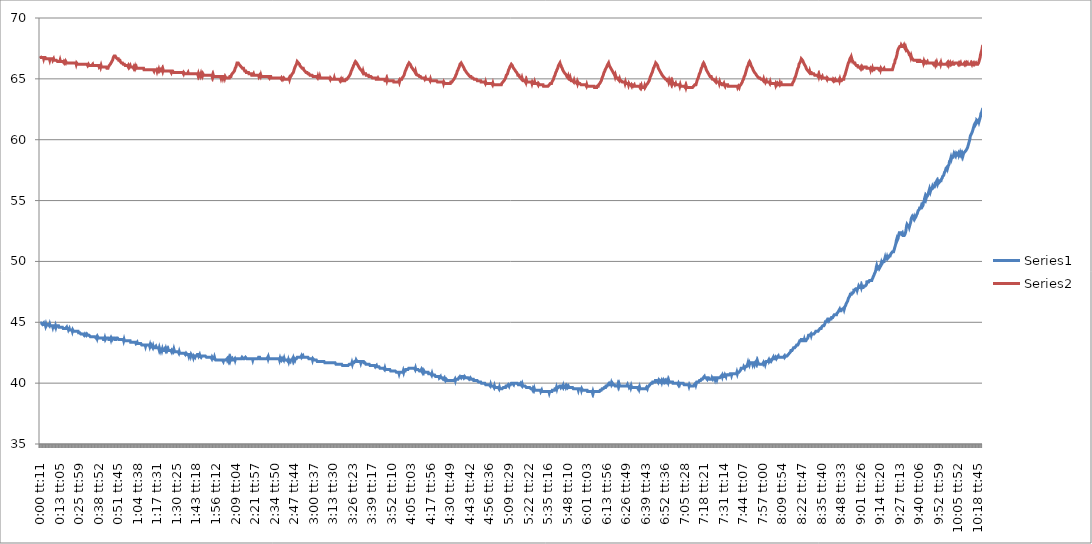
| Category | Series 0 | Series 1 |
|---|---|---|
| 0.0001273148148148148 | 44.938 | 66.875 |
| 0.0003125 | 44.938 | 66.875 |
| 0.00048611111111111104 | 44.938 | 66.762 |
| 0.0006597222222222221 | 44.938 | 66.762 |
| 0.0008333333333333334 | 44.938 | 66.762 |
| 0.0010069444444444444 | 44.938 | 66.762 |
| 0.0011921296296296296 | 44.825 | 66.762 |
| 0.001365740740740741 | 44.825 | 66.762 |
| 0.0015393518518518519 | 44.825 | 66.762 |
| 0.001712962962962963 | 44.938 | 66.65 |
| 0.0018865740740740742 | 44.825 | 66.762 |
| 0.0020601851851851853 | 44.825 | 66.762 |
| 0.0022337962962962967 | 44.825 | 66.762 |
| 0.0024189814814814816 | 44.825 | 66.762 |
| 0.0025925925925925925 | 44.712 | 66.762 |
| 0.0027662037037037034 | 44.825 | 66.65 |
| 0.002939814814814815 | 44.712 | 66.65 |
| 0.0031134259259259257 | 44.712 | 66.65 |
| 0.003298611111111111 | 44.825 | 66.65 |
| 0.003472222222222222 | 44.825 | 66.65 |
| 0.003645833333333333 | 44.825 | 66.65 |
| 0.0038194444444444443 | 44.825 | 66.65 |
| 0.003993055555555556 | 44.825 | 66.65 |
| 0.004166666666666667 | 44.825 | 66.65 |
| 0.0043518518518518515 | 44.712 | 66.65 |
| 0.004525462962962963 | 44.825 | 66.538 |
| 0.004699074074074074 | 44.712 | 66.65 |
| 0.004872685185185186 | 44.712 | 66.65 |
| 0.005046296296296296 | 44.712 | 66.65 |
| 0.005219907407407407 | 44.712 | 66.65 |
| 0.005393518518518519 | 44.712 | 66.65 |
| 0.005578703703703704 | 44.712 | 66.65 |
| 0.005752314814814814 | 44.712 | 66.65 |
| 0.005925925925925926 | 44.6 | 66.538 |
| 0.006099537037037036 | 44.712 | 66.538 |
| 0.006273148148148148 | 44.712 | 66.65 |
| 0.00644675925925926 | 44.712 | 66.538 |
| 0.00662037037037037 | 44.712 | 66.538 |
| 0.006805555555555557 | 44.712 | 66.538 |
| 0.006979166666666667 | 44.6 | 66.538 |
| 0.007152777777777779 | 44.712 | 66.538 |
| 0.007326388888888889 | 44.6 | 66.538 |
| 0.007500000000000001 | 44.712 | 66.538 |
| 0.007673611111111111 | 44.712 | 66.538 |
| 0.007858796296296296 | 44.712 | 66.538 |
| 0.008032407407407407 | 44.712 | 66.425 |
| 0.008206018518518519 | 44.712 | 66.425 |
| 0.00837962962962963 | 44.712 | 66.425 |
| 0.008553240740740741 | 44.712 | 66.425 |
| 0.008726851851851852 | 44.6 | 66.425 |
| 0.008900462962962962 | 44.6 | 66.425 |
| 0.009085648148148148 | 44.6 | 66.425 |
| 0.00925925925925926 | 44.6 | 66.538 |
| 0.009432870370370371 | 44.6 | 66.425 |
| 0.009606481481481481 | 44.6 | 66.425 |
| 0.009791666666666666 | 44.6 | 66.425 |
| 0.009965277777777778 | 44.6 | 66.425 |
| 0.010138888888888888 | 44.6 | 66.425 |
| 0.0103125 | 44.6 | 66.425 |
| 0.010486111111111111 | 44.6 | 66.425 |
| 0.010659722222222221 | 44.488 | 66.425 |
| 0.010844907407407407 | 44.488 | 66.425 |
| 0.011018518518518518 | 44.488 | 66.312 |
| 0.01119212962962963 | 44.488 | 66.425 |
| 0.01136574074074074 | 44.488 | 66.425 |
| 0.011539351851851851 | 44.488 | 66.425 |
| 0.011712962962962965 | 44.488 | 66.312 |
| 0.011898148148148149 | 44.488 | 66.425 |
| 0.01207175925925926 | 44.488 | 66.425 |
| 0.01224537037037037 | 44.6 | 66.312 |
| 0.012418981481481482 | 44.488 | 66.312 |
| 0.012592592592592593 | 44.488 | 66.312 |
| 0.012766203703703703 | 44.488 | 66.312 |
| 0.012951388888888887 | 44.488 | 66.312 |
| 0.013125 | 44.375 | 66.312 |
| 0.01329861111111111 | 44.375 | 66.312 |
| 0.01347222222222222 | 44.488 | 66.312 |
| 0.013645833333333331 | 44.375 | 66.312 |
| 0.013819444444444445 | 44.375 | 66.312 |
| 0.01400462962962963 | 44.375 | 66.312 |
| 0.014178240740740741 | 44.375 | 66.312 |
| 0.014351851851851852 | 44.375 | 66.312 |
| 0.014525462962962964 | 44.375 | 66.312 |
| 0.014699074074074074 | 44.375 | 66.312 |
| 0.014872685185185185 | 44.262 | 66.312 |
| 0.015057870370370369 | 44.375 | 66.312 |
| 0.015231481481481483 | 44.375 | 66.312 |
| 0.015405092592592593 | 44.262 | 66.312 |
| 0.015578703703703704 | 44.262 | 66.312 |
| 0.015752314814814813 | 44.262 | 66.312 |
| 0.015925925925925927 | 44.262 | 66.312 |
| 0.01611111111111111 | 44.262 | 66.312 |
| 0.01628472222222222 | 44.262 | 66.312 |
| 0.016458333333333332 | 44.262 | 66.312 |
| 0.016631944444444446 | 44.262 | 66.2 |
| 0.016805555555555556 | 44.262 | 66.312 |
| 0.01699074074074074 | 44.262 | 66.312 |
| 0.01716435185185185 | 44.262 | 66.312 |
| 0.01733796296296296 | 44.262 | 66.2 |
| 0.017511574074074072 | 44.262 | 66.2 |
| 0.017685185185185182 | 44.15 | 66.2 |
| 0.017858796296296296 | 44.15 | 66.2 |
| 0.018043981481481484 | 44.15 | 66.2 |
| 0.018217592592592594 | 44.15 | 66.2 |
| 0.018391203703703705 | 44.15 | 66.2 |
| 0.018564814814814815 | 44.15 | 66.2 |
| 0.018738425925925926 | 44.038 | 66.2 |
| 0.018912037037037036 | 44.038 | 66.2 |
| 0.01909722222222222 | 44.038 | 66.2 |
| 0.019270833333333334 | 44.038 | 66.2 |
| 0.019444444444444445 | 44.038 | 66.2 |
| 0.019618055555555555 | 44.038 | 66.2 |
| 0.019791666666666666 | 44.038 | 66.2 |
| 0.01996527777777778 | 44.038 | 66.2 |
| 0.020150462962962964 | 44.038 | 66.2 |
| 0.020324074074074074 | 43.925 | 66.2 |
| 0.020497685185185185 | 43.925 | 66.2 |
| 0.020671296296296295 | 44.038 | 66.2 |
| 0.020844907407407406 | 44.038 | 66.2 |
| 0.02101851851851852 | 44.038 | 66.2 |
| 0.02119212962962963 | 43.925 | 66.2 |
| 0.021377314814814818 | 43.925 | 66.2 |
| 0.021550925925925928 | 44.038 | 66.2 |
| 0.02172453703703704 | 44.038 | 66.2 |
| 0.02189814814814815 | 44.038 | 66.088 |
| 0.02207175925925926 | 43.925 | 66.088 |
| 0.02224537037037037 | 43.925 | 66.2 |
| 0.022430555555555554 | 43.925 | 66.2 |
| 0.022604166666666665 | 43.925 | 66.088 |
| 0.022777777777777775 | 43.925 | 66.088 |
| 0.022951388888888886 | 43.925 | 66.088 |
| 0.023124999999999996 | 43.812 | 66.088 |
| 0.023298611111111107 | 43.812 | 66.088 |
| 0.023483796296296298 | 43.812 | 66.088 |
| 0.023657407407407408 | 43.812 | 66.088 |
| 0.02383101851851852 | 43.812 | 66.088 |
| 0.02400462962962963 | 43.812 | 66.088 |
| 0.02417824074074074 | 43.812 | 66.2 |
| 0.024351851851851857 | 43.812 | 66.088 |
| 0.024537037037037038 | 43.812 | 66.088 |
| 0.024710648148148148 | 43.812 | 66.088 |
| 0.02488425925925926 | 43.812 | 66.088 |
| 0.025057870370370373 | 43.812 | 66.088 |
| 0.025231481481481483 | 43.812 | 66.088 |
| 0.025405092592592594 | 43.812 | 66.088 |
| 0.025578703703703704 | 43.812 | 66.088 |
| 0.02576388888888889 | 43.7 | 66.088 |
| 0.025937500000000002 | 43.7 | 66.088 |
| 0.026111111111111113 | 43.812 | 66.088 |
| 0.026284722222222223 | 43.7 | 66.088 |
| 0.026458333333333334 | 43.812 | 66.088 |
| 0.026631944444444444 | 43.812 | 66.088 |
| 0.026805555555555555 | 43.7 | 66.088 |
| 0.026990740740740742 | 43.7 | 66.088 |
| 0.027164351851851853 | 43.7 | 65.975 |
| 0.027337962962962963 | 43.7 | 65.975 |
| 0.027511574074074074 | 43.7 | 65.975 |
| 0.027685185185185188 | 43.7 | 66.088 |
| 0.027858796296296298 | 43.7 | 65.975 |
| 0.02803240740740741 | 43.7 | 66.088 |
| 0.02821759259259259 | 43.7 | 65.975 |
| 0.028391203703703707 | 43.7 | 65.975 |
| 0.028564814814814817 | 43.7 | 65.975 |
| 0.028738425925925928 | 43.7 | 65.975 |
| 0.028912037037037038 | 43.7 | 65.975 |
| 0.02908564814814815 | 43.588 | 65.975 |
| 0.029270833333333333 | 43.588 | 65.975 |
| 0.029444444444444443 | 43.588 | 65.975 |
| 0.029618055555555554 | 43.588 | 65.975 |
| 0.029791666666666664 | 43.7 | 65.975 |
| 0.029965277777777775 | 43.588 | 65.975 |
| 0.030150462962962962 | 43.588 | 65.975 |
| 0.030324074074074073 | 43.7 | 65.975 |
| 0.030497685185185183 | 43.7 | 65.975 |
| 0.030671296296296294 | 43.7 | 65.862 |
| 0.030844907407407404 | 43.7 | 65.862 |
| 0.031018518518518515 | 43.7 | 65.862 |
| 0.031203703703703702 | 43.7 | 65.862 |
| 0.03137731481481481 | 43.7 | 65.975 |
| 0.03155092592592592 | 43.588 | 65.975 |
| 0.03172453703703703 | 43.588 | 66.088 |
| 0.03189814814814815 | 43.588 | 66.088 |
| 0.03207175925925926 | 43.588 | 66.088 |
| 0.03225694444444444 | 43.588 | 66.2 |
| 0.03243055555555556 | 43.7 | 66.2 |
| 0.03260416666666667 | 43.588 | 66.312 |
| 0.03277777777777778 | 43.7 | 66.312 |
| 0.03295138888888889 | 43.7 | 66.425 |
| 0.033136574074074075 | 43.588 | 66.425 |
| 0.033310185185185186 | 43.588 | 66.538 |
| 0.033483796296296296 | 43.7 | 66.65 |
| 0.03365740740740741 | 43.7 | 66.762 |
| 0.03383101851851852 | 43.7 | 66.762 |
| 0.03400462962962963 | 43.7 | 66.875 |
| 0.03418981481481482 | 43.7 | 66.875 |
| 0.03436342592592593 | 43.588 | 66.875 |
| 0.03453703703703704 | 43.588 | 66.875 |
| 0.03471064814814815 | 43.588 | 66.875 |
| 0.03488425925925926 | 43.588 | 66.762 |
| 0.03505787037037037 | 43.7 | 66.762 |
| 0.035243055555555555 | 43.7 | 66.762 |
| 0.035416666666666666 | 43.7 | 66.65 |
| 0.035590277777777776 | 43.7 | 66.65 |
| 0.03576388888888889 | 43.7 | 66.65 |
| 0.035937500000000004 | 43.7 | 66.65 |
| 0.036111111111111115 | 43.588 | 66.538 |
| 0.03629629629629629 | 43.588 | 66.538 |
| 0.0364699074074074 | 43.588 | 66.538 |
| 0.03664351851851852 | 43.588 | 66.538 |
| 0.03681712962962963 | 43.588 | 66.425 |
| 0.03699074074074074 | 43.588 | 66.425 |
| 0.03716435185185185 | 43.588 | 66.425 |
| 0.03733796296296296 | 43.588 | 66.312 |
| 0.037523148148148146 | 43.588 | 66.312 |
| 0.037696759259259256 | 43.588 | 66.312 |
| 0.03787037037037037 | 43.588 | 66.312 |
| 0.03804398148148148 | 43.588 | 66.312 |
| 0.03821759259259259 | 43.588 | 66.2 |
| 0.0383912037037037 | 43.475 | 66.2 |
| 0.03857638888888889 | 43.588 | 66.2 |
| 0.03875 | 43.475 | 66.2 |
| 0.03892361111111111 | 43.475 | 66.2 |
| 0.03909722222222222 | 43.475 | 66.088 |
| 0.03927083333333333 | 43.475 | 66.088 |
| 0.03944444444444444 | 43.475 | 66.088 |
| 0.03961805555555555 | 43.475 | 66.088 |
| 0.03980324074074074 | 43.475 | 66.088 |
| 0.039976851851851854 | 43.475 | 66.088 |
| 0.040150462962962964 | 43.475 | 66.088 |
| 0.040324074074074075 | 43.475 | 66.088 |
| 0.040497685185185185 | 43.475 | 65.975 |
| 0.040671296296296296 | 43.475 | 66.088 |
| 0.040844907407407406 | 43.475 | 66.088 |
| 0.0410300925925926 | 43.475 | 65.975 |
| 0.04120370370370371 | 43.475 | 65.975 |
| 0.04137731481481482 | 43.475 | 66.088 |
| 0.04155092592592593 | 43.362 | 65.975 |
| 0.04172453703703704 | 43.362 | 65.975 |
| 0.04189814814814815 | 43.362 | 65.975 |
| 0.042083333333333334 | 43.362 | 65.975 |
| 0.042256944444444444 | 43.362 | 65.975 |
| 0.042430555555555555 | 43.362 | 65.975 |
| 0.042604166666666665 | 43.362 | 65.975 |
| 0.042777777777777776 | 43.362 | 65.975 |
| 0.042951388888888886 | 43.362 | 65.862 |
| 0.04313657407407407 | 43.362 | 65.975 |
| 0.04331018518518518 | 43.362 | 65.975 |
| 0.04348379629629629 | 43.362 | 65.862 |
| 0.0436574074074074 | 43.362 | 65.975 |
| 0.04383101851851851 | 43.362 | 65.862 |
| 0.04400462962962962 | 43.25 | 65.862 |
| 0.04417824074074075 | 43.25 | 65.975 |
| 0.044363425925925924 | 43.25 | 65.862 |
| 0.04453703703703704 | 43.362 | 65.862 |
| 0.04471064814814815 | 43.25 | 65.862 |
| 0.04488425925925926 | 43.25 | 65.862 |
| 0.04505787037037037 | 43.25 | 65.862 |
| 0.045231481481481484 | 43.25 | 65.862 |
| 0.04541666666666667 | 43.25 | 65.862 |
| 0.04559027777777778 | 43.25 | 65.862 |
| 0.04576388888888889 | 43.25 | 65.862 |
| 0.0459375 | 43.25 | 65.862 |
| 0.04611111111111111 | 43.25 | 65.862 |
| 0.04628472222222222 | 43.25 | 65.862 |
| 0.04646990740740741 | 43.25 | 65.862 |
| 0.04664351851851852 | 43.138 | 65.862 |
| 0.04681712962962963 | 43.138 | 65.862 |
| 0.04699074074074074 | 43.138 | 65.862 |
| 0.04716435185185185 | 43.138 | 65.862 |
| 0.047337962962962964 | 43.138 | 65.862 |
| 0.047511574074074074 | 43.138 | 65.862 |
| 0.04769675925925926 | 43.138 | 65.75 |
| 0.04787037037037037 | 43.138 | 65.75 |
| 0.04804398148148148 | 43.138 | 65.75 |
| 0.04821759259259259 | 43.138 | 65.75 |
| 0.0483912037037037 | 43.025 | 65.75 |
| 0.048576388888888884 | 43.138 | 65.75 |
| 0.048749999999999995 | 43.138 | 65.75 |
| 0.048923611111111105 | 43.138 | 65.75 |
| 0.049097222222222216 | 43.138 | 65.75 |
| 0.04927083333333334 | 43.138 | 65.75 |
| 0.04944444444444444 | 43.138 | 65.75 |
| 0.04961805555555556 | 43.138 | 65.75 |
| 0.04980324074074074 | 43.138 | 65.75 |
| 0.049976851851851856 | 43.138 | 65.75 |
| 0.050150462962962966 | 43.138 | 65.75 |
| 0.05032407407407408 | 43.025 | 65.75 |
| 0.05049768518518519 | 43.138 | 65.75 |
| 0.0506712962962963 | 43.025 | 65.75 |
| 0.05085648148148148 | 43.025 | 65.75 |
| 0.05103009259259259 | 43.138 | 65.75 |
| 0.0512037037037037 | 43.138 | 65.75 |
| 0.05137731481481481 | 43.025 | 65.75 |
| 0.051550925925925924 | 43.025 | 65.75 |
| 0.051724537037037034 | 42.912 | 65.75 |
| 0.051909722222222225 | 43.025 | 65.75 |
| 0.052083333333333336 | 42.912 | 65.75 |
| 0.052256944444444446 | 42.912 | 65.638 |
| 0.05243055555555556 | 42.912 | 65.75 |
| 0.05260416666666667 | 42.912 | 65.75 |
| 0.05277777777777778 | 42.912 | 65.75 |
| 0.05295138888888889 | 42.912 | 65.75 |
| 0.05313657407407407 | 43.025 | 65.75 |
| 0.05331018518518518 | 42.912 | 65.75 |
| 0.05348379629629629 | 42.912 | 65.75 |
| 0.053657407407407404 | 42.912 | 65.638 |
| 0.053831018518518514 | 42.912 | 65.75 |
| 0.05400462962962963 | 42.912 | 65.75 |
| 0.05418981481481481 | 42.912 | 65.75 |
| 0.05436342592592593 | 42.912 | 65.638 |
| 0.054537037037037044 | 42.8 | 65.75 |
| 0.054710648148148154 | 42.912 | 65.638 |
| 0.054884259259259265 | 42.8 | 65.638 |
| 0.055057870370370375 | 42.688 | 65.638 |
| 0.05524305555555556 | 42.8 | 65.75 |
| 0.05541666666666667 | 42.8 | 65.638 |
| 0.05559027777777778 | 42.8 | 65.638 |
| 0.05576388888888889 | 42.8 | 65.638 |
| 0.0559375 | 42.688 | 65.638 |
| 0.05611111111111111 | 42.8 | 65.75 |
| 0.05628472222222222 | 42.688 | 65.638 |
| 0.056469907407407406 | 42.688 | 65.75 |
| 0.05664351851851852 | 42.688 | 65.638 |
| 0.05681712962962963 | 42.688 | 65.638 |
| 0.05699074074074074 | 42.688 | 65.638 |
| 0.05716435185185185 | 42.8 | 65.638 |
| 0.05733796296296296 | 42.8 | 65.638 |
| 0.05752314814814815 | 42.688 | 65.638 |
| 0.05769675925925926 | 42.8 | 65.638 |
| 0.05787037037037037 | 42.688 | 65.638 |
| 0.05804398148148148 | 42.688 | 65.638 |
| 0.05821759259259259 | 42.8 | 65.638 |
| 0.0583912037037037 | 42.688 | 65.638 |
| 0.058576388888888886 | 42.688 | 65.638 |
| 0.058750000000000004 | 42.8 | 65.638 |
| 0.05892361111111111 | 42.688 | 65.638 |
| 0.059097222222222225 | 42.688 | 65.638 |
| 0.059270833333333335 | 42.688 | 65.638 |
| 0.059444444444444446 | 42.688 | 65.638 |
| 0.059618055555555556 | 42.688 | 65.638 |
| 0.05980324074074075 | 42.688 | 65.638 |
| 0.05997685185185186 | 42.688 | 65.638 |
| 0.06015046296296297 | 42.688 | 65.525 |
| 0.06032407407407408 | 42.575 | 65.638 |
| 0.06049768518518519 | 42.688 | 65.638 |
| 0.06068287037037037 | 42.688 | 65.638 |
| 0.060856481481481484 | 42.688 | 65.638 |
| 0.061030092592592594 | 42.575 | 65.638 |
| 0.061203703703703705 | 42.688 | 65.525 |
| 0.061377314814814815 | 42.8 | 65.525 |
| 0.061550925925925926 | 42.688 | 65.525 |
| 0.06173611111111111 | 42.575 | 65.525 |
| 0.06190972222222222 | 42.575 | 65.525 |
| 0.06208333333333333 | 42.575 | 65.525 |
| 0.06225694444444444 | 42.575 | 65.525 |
| 0.06243055555555555 | 42.575 | 65.525 |
| 0.06260416666666667 | 42.575 | 65.525 |
| 0.06278935185185185 | 42.575 | 65.525 |
| 0.06296296296296296 | 42.575 | 65.525 |
| 0.06313657407407408 | 42.575 | 65.525 |
| 0.06331018518518518 | 42.575 | 65.525 |
| 0.0634837962962963 | 42.575 | 65.525 |
| 0.0636574074074074 | 42.462 | 65.525 |
| 0.0638425925925926 | 42.575 | 65.525 |
| 0.0640162037037037 | 42.462 | 65.525 |
| 0.06418981481481481 | 42.462 | 65.525 |
| 0.06436342592592592 | 42.462 | 65.525 |
| 0.06453703703703705 | 42.462 | 65.525 |
| 0.06471064814814814 | 42.462 | 65.525 |
| 0.06489583333333333 | 42.462 | 65.525 |
| 0.06506944444444444 | 42.462 | 65.525 |
| 0.06524305555555555 | 42.462 | 65.525 |
| 0.06541666666666666 | 42.462 | 65.525 |
| 0.06559027777777778 | 42.462 | 65.525 |
| 0.06577546296296297 | 42.462 | 65.412 |
| 0.06594907407407408 | 42.462 | 65.525 |
| 0.06612268518518519 | 42.462 | 65.525 |
| 0.0662962962962963 | 42.462 | 65.525 |
| 0.06646990740740741 | 42.462 | 65.412 |
| 0.0666550925925926 | 42.35 | 65.412 |
| 0.06682870370370371 | 42.35 | 65.412 |
| 0.06700231481481482 | 42.462 | 65.412 |
| 0.06717592592592593 | 42.462 | 65.412 |
| 0.06734953703703704 | 42.462 | 65.412 |
| 0.06752314814814815 | 42.35 | 65.412 |
| 0.06770833333333333 | 42.35 | 65.412 |
| 0.06788194444444444 | 42.35 | 65.525 |
| 0.06805555555555555 | 42.35 | 65.412 |
| 0.06822916666666666 | 42.238 | 65.412 |
| 0.06840277777777777 | 42.35 | 65.412 |
| 0.0685763888888889 | 42.35 | 65.412 |
| 0.06874999999999999 | 42.35 | 65.412 |
| 0.06892361111111112 | 42.35 | 65.412 |
| 0.0691087962962963 | 42.238 | 65.412 |
| 0.06928240740740742 | 42.35 | 65.412 |
| 0.06945601851851851 | 42.35 | 65.412 |
| 0.06962962962962964 | 42.238 | 65.412 |
| 0.06980324074074074 | 42.238 | 65.412 |
| 0.06997685185185186 | 42.238 | 65.412 |
| 0.07016203703703704 | 42.238 | 65.412 |
| 0.07033564814814815 | 42.125 | 65.412 |
| 0.07050925925925926 | 42.238 | 65.412 |
| 0.07068287037037037 | 42.238 | 65.412 |
| 0.07085648148148148 | 42.238 | 65.412 |
| 0.07103009259259259 | 42.125 | 65.412 |
| 0.0712037037037037 | 42.238 | 65.412 |
| 0.07138888888888889 | 42.238 | 65.412 |
| 0.07156249999999999 | 42.238 | 65.412 |
| 0.07173611111111111 | 42.238 | 65.412 |
| 0.07190972222222222 | 42.238 | 65.412 |
| 0.07208333333333333 | 42.35 | 65.412 |
| 0.07225694444444444 | 42.35 | 65.412 |
| 0.07244212962962963 | 42.35 | 65.3 |
| 0.07261574074074074 | 42.35 | 65.412 |
| 0.07278935185185186 | 42.238 | 65.3 |
| 0.07296296296296297 | 42.238 | 65.412 |
| 0.07313657407407408 | 42.35 | 65.412 |
| 0.07331018518518519 | 42.238 | 65.412 |
| 0.07349537037037036 | 42.238 | 65.412 |
| 0.07366898148148149 | 42.238 | 65.3 |
| 0.07384259259259258 | 42.125 | 65.412 |
| 0.07401620370370371 | 42.125 | 65.3 |
| 0.0741898148148148 | 42.238 | 65.3 |
| 0.07436342592592593 | 42.238 | 65.412 |
| 0.07454861111111111 | 42.238 | 65.3 |
| 0.07472222222222223 | 42.238 | 65.412 |
| 0.07489583333333333 | 42.238 | 65.412 |
| 0.07506944444444445 | 42.238 | 65.3 |
| 0.07524305555555556 | 42.238 | 65.3 |
| 0.07542824074074074 | 42.238 | 65.3 |
| 0.07560185185185185 | 42.238 | 65.3 |
| 0.07577546296296296 | 42.238 | 65.3 |
| 0.07594907407407407 | 42.238 | 65.3 |
| 0.07612268518518518 | 42.238 | 65.3 |
| 0.07629629629629629 | 42.125 | 65.3 |
| 0.07648148148148148 | 42.125 | 65.3 |
| 0.0766550925925926 | 42.125 | 65.3 |
| 0.0768287037037037 | 42.125 | 65.3 |
| 0.07700231481481482 | 42.125 | 65.3 |
| 0.07717592592592593 | 42.125 | 65.3 |
| 0.07736111111111112 | 42.125 | 65.3 |
| 0.07753472222222223 | 42.125 | 65.3 |
| 0.07770833333333334 | 42.125 | 65.3 |
| 0.07788194444444445 | 42.125 | 65.3 |
| 0.07805555555555556 | 42.125 | 65.3 |
| 0.07822916666666667 | 42.125 | 65.3 |
| 0.07841435185185185 | 42.125 | 65.3 |
| 0.07858796296296296 | 42.125 | 65.3 |
| 0.07876157407407407 | 42.012 | 65.3 |
| 0.07893518518518518 | 42.125 | 65.188 |
| 0.07910879629629629 | 42.125 | 65.3 |
| 0.0792824074074074 | 42.012 | 65.188 |
| 0.07945601851851852 | 42.012 | 65.3 |
| 0.0796412037037037 | 42.012 | 65.188 |
| 0.07981481481481481 | 42.012 | 65.188 |
| 0.07998842592592592 | 42.125 | 65.188 |
| 0.08016203703703705 | 42.012 | 65.188 |
| 0.08033564814814814 | 42.012 | 65.188 |
| 0.08050925925925927 | 41.9 | 65.188 |
| 0.08069444444444444 | 41.9 | 65.188 |
| 0.08086805555555555 | 41.9 | 65.188 |
| 0.08104166666666666 | 41.9 | 65.188 |
| 0.08121527777777778 | 41.9 | 65.188 |
| 0.08138888888888889 | 41.9 | 65.188 |
| 0.0815625 | 41.9 | 65.188 |
| 0.08174768518518519 | 41.9 | 65.188 |
| 0.0819212962962963 | 41.9 | 65.188 |
| 0.08209490740740741 | 41.9 | 65.188 |
| 0.08226851851851852 | 41.9 | 65.188 |
| 0.08244212962962963 | 41.9 | 65.188 |
| 0.08261574074074074 | 41.9 | 65.188 |
| 0.08280092592592593 | 41.9 | 65.188 |
| 0.08297453703703704 | 41.9 | 65.075 |
| 0.08314814814814815 | 41.9 | 65.188 |
| 0.08332175925925926 | 41.9 | 65.188 |
| 0.08349537037037037 | 41.9 | 65.188 |
| 0.08366898148148148 | 41.9 | 65.188 |
| 0.0838425925925926 | 41.9 | 65.075 |
| 0.08402777777777777 | 41.788 | 65.188 |
| 0.0842013888888889 | 41.9 | 65.188 |
| 0.08437499999999999 | 41.9 | 65.188 |
| 0.08454861111111112 | 41.9 | 65.188 |
| 0.08472222222222221 | 41.9 | 65.075 |
| 0.08490740740740742 | 41.9 | 65.188 |
| 0.08508101851851851 | 41.9 | 65.188 |
| 0.08525462962962964 | 41.9 | 65.075 |
| 0.08542824074074074 | 41.9 | 65.075 |
| 0.08560185185185186 | 41.9 | 65.075 |
| 0.08577546296296296 | 42.012 | 65.075 |
| 0.08594907407407408 | 41.9 | 65.075 |
| 0.08612268518518518 | 41.9 | 65.075 |
| 0.08630787037037037 | 42.012 | 65.075 |
| 0.08648148148148148 | 41.9 | 65.075 |
| 0.08665509259259259 | 42.012 | 65.075 |
| 0.0868287037037037 | 41.9 | 65.075 |
| 0.08700231481481481 | 42.012 | 65.188 |
| 0.08718749999999999 | 41.9 | 65.188 |
| 0.08736111111111111 | 42.012 | 65.188 |
| 0.08753472222222221 | 41.9 | 65.188 |
| 0.08770833333333333 | 41.9 | 65.3 |
| 0.08788194444444446 | 41.9 | 65.3 |
| 0.08805555555555555 | 42.012 | 65.412 |
| 0.08822916666666668 | 41.9 | 65.412 |
| 0.08840277777777777 | 41.9 | 65.412 |
| 0.08858796296296297 | 41.9 | 65.525 |
| 0.08876157407407408 | 41.9 | 65.525 |
| 0.08893518518518519 | 41.9 | 65.525 |
| 0.0891087962962963 | 41.9 | 65.638 |
| 0.08928240740740741 | 42.012 | 65.75 |
| 0.08945601851851852 | 41.9 | 65.862 |
| 0.08962962962962963 | 42.012 | 65.862 |
| 0.0898148148148148 | 42.012 | 65.975 |
| 0.08998842592592593 | 42.012 | 66.088 |
| 0.09016203703703703 | 42.012 | 66.2 |
| 0.09033564814814815 | 42.012 | 66.312 |
| 0.09050925925925925 | 42.012 | 66.312 |
| 0.09068287037037037 | 42.012 | 66.312 |
| 0.09086805555555555 | 42.012 | 66.312 |
| 0.09104166666666667 | 42.012 | 66.312 |
| 0.09121527777777777 | 42.012 | 66.2 |
| 0.0913888888888889 | 42.012 | 66.2 |
| 0.09156249999999999 | 42.012 | 66.2 |
| 0.09173611111111112 | 42.012 | 66.088 |
| 0.09190972222222223 | 42.012 | 66.088 |
| 0.0920949074074074 | 42.012 | 66.088 |
| 0.09226851851851853 | 42.012 | 65.975 |
| 0.09244212962962962 | 42.012 | 65.975 |
| 0.09261574074074075 | 42.125 | 65.975 |
| 0.09278935185185185 | 42.125 | 65.862 |
| 0.09296296296296297 | 42.125 | 65.862 |
| 0.09313657407407407 | 42.012 | 65.862 |
| 0.09332175925925927 | 42.012 | 65.862 |
| 0.09349537037037037 | 42.012 | 65.75 |
| 0.09366898148148149 | 42.012 | 65.75 |
| 0.09384259259259259 | 42.012 | 65.638 |
| 0.09401620370370371 | 42.012 | 65.638 |
| 0.09418981481481481 | 42.125 | 65.638 |
| 0.09436342592592593 | 42.125 | 65.638 |
| 0.09454861111111111 | 42.125 | 65.525 |
| 0.09472222222222222 | 42.012 | 65.525 |
| 0.09489583333333333 | 42.012 | 65.525 |
| 0.09506944444444444 | 42.012 | 65.525 |
| 0.09524305555555555 | 42.012 | 65.525 |
| 0.09541666666666666 | 42.012 | 65.525 |
| 0.09560185185185184 | 42.012 | 65.525 |
| 0.09577546296296297 | 42.012 | 65.412 |
| 0.09594907407407409 | 42.012 | 65.412 |
| 0.09612268518518519 | 42.012 | 65.412 |
| 0.09629629629629628 | 42.012 | 65.412 |
| 0.09646990740740741 | 42.012 | 65.412 |
| 0.0966550925925926 | 42.012 | 65.412 |
| 0.09682870370370371 | 42.012 | 65.412 |
| 0.0970023148148148 | 42.012 | 65.3 |
| 0.09717592592592593 | 42.012 | 65.3 |
| 0.09734953703703704 | 42.012 | 65.3 |
| 0.09752314814814815 | 41.9 | 65.3 |
| 0.09770833333333333 | 42.012 | 65.3 |
| 0.09788194444444444 | 42.012 | 65.412 |
| 0.09805555555555556 | 42.012 | 65.3 |
| 0.09822916666666666 | 42.012 | 65.3 |
| 0.09840277777777778 | 42.012 | 65.3 |
| 0.09857638888888888 | 42.012 | 65.3 |
| 0.09876157407407408 | 42.012 | 65.3 |
| 0.09893518518518518 | 42.012 | 65.3 |
| 0.0991087962962963 | 42.012 | 65.3 |
| 0.0992824074074074 | 42.012 | 65.3 |
| 0.09945601851851853 | 42.012 | 65.3 |
| 0.09962962962962962 | 42.012 | 65.3 |
| 0.09980324074074075 | 42.012 | 65.3 |
| 0.09998842592592593 | 42.012 | 65.3 |
| 0.10016203703703704 | 42.125 | 65.3 |
| 0.10033564814814815 | 42.125 | 65.188 |
| 0.10050925925925926 | 42.125 | 65.188 |
| 0.10068287037037038 | 42.125 | 65.3 |
| 0.10085648148148148 | 42.012 | 65.3 |
| 0.10104166666666665 | 42.012 | 65.188 |
| 0.10121527777777778 | 42.012 | 65.3 |
| 0.1013888888888889 | 42.012 | 65.188 |
| 0.1015625 | 42.012 | 65.188 |
| 0.1017361111111111 | 42.012 | 65.188 |
| 0.10190972222222222 | 42.012 | 65.188 |
| 0.10208333333333335 | 42.012 | 65.188 |
| 0.10226851851851852 | 42.012 | 65.188 |
| 0.10244212962962962 | 42.012 | 65.188 |
| 0.10261574074074074 | 42.012 | 65.188 |
| 0.10278935185185185 | 42.012 | 65.188 |
| 0.10296296296296296 | 42.012 | 65.188 |
| 0.10313657407407407 | 42.012 | 65.188 |
| 0.10332175925925925 | 42.012 | 65.188 |
| 0.10349537037037038 | 42.012 | 65.188 |
| 0.10366898148148147 | 42.012 | 65.188 |
| 0.1038425925925926 | 42.012 | 65.188 |
| 0.1040162037037037 | 42.012 | 65.188 |
| 0.10418981481481482 | 42.012 | 65.188 |
| 0.104375 | 42.125 | 65.188 |
| 0.10454861111111112 | 42.012 | 65.188 |
| 0.10472222222222222 | 42.125 | 65.188 |
| 0.10489583333333334 | 42.012 | 65.188 |
| 0.10506944444444444 | 42.012 | 65.075 |
| 0.10524305555555556 | 42.012 | 65.188 |
| 0.10541666666666667 | 42.012 | 65.188 |
| 0.10560185185185185 | 42.012 | 65.188 |
| 0.10577546296296296 | 42.012 | 65.188 |
| 0.10594907407407407 | 42.012 | 65.075 |
| 0.1061226851851852 | 42.012 | 65.075 |
| 0.10629629629629629 | 42.012 | 65.075 |
| 0.10646990740740742 | 42.012 | 65.075 |
| 0.10665509259259259 | 42.012 | 65.075 |
| 0.10682870370370372 | 42.012 | 65.075 |
| 0.10700231481481481 | 42.012 | 65.075 |
| 0.10717592592592594 | 42.012 | 65.075 |
| 0.10734953703703703 | 42.012 | 65.075 |
| 0.10752314814814816 | 42.012 | 65.075 |
| 0.10770833333333334 | 42.012 | 65.075 |
| 0.10788194444444445 | 42.012 | 65.075 |
| 0.10805555555555556 | 42.012 | 65.075 |
| 0.10822916666666667 | 42.012 | 65.075 |
| 0.10840277777777778 | 42.012 | 65.075 |
| 0.10857638888888889 | 42.012 | 65.075 |
| 0.10875 | 42.012 | 65.075 |
| 0.10893518518518519 | 42.012 | 65.075 |
| 0.10910879629629629 | 42.012 | 65.075 |
| 0.10928240740740741 | 42.012 | 65.075 |
| 0.10945601851851851 | 42.012 | 65.075 |
| 0.10962962962962963 | 42.012 | 65.075 |
| 0.10980324074074073 | 41.9 | 65.075 |
| 0.10998842592592593 | 42.012 | 65.075 |
| 0.11016203703703703 | 41.9 | 65.075 |
| 0.11033564814814815 | 41.9 | 65.075 |
| 0.11050925925925925 | 41.9 | 65.075 |
| 0.11068287037037038 | 42.012 | 64.963 |
| 0.11085648148148149 | 41.9 | 65.075 |
| 0.11104166666666666 | 41.9 | 65.075 |
| 0.11121527777777777 | 41.9 | 65.075 |
| 0.11138888888888888 | 42.012 | 64.963 |
| 0.11156250000000001 | 42.012 | 64.963 |
| 0.1117361111111111 | 41.9 | 65.075 |
| 0.11192129629629628 | 42.012 | 65.075 |
| 0.11209490740740741 | 41.9 | 65.075 |
| 0.11226851851851853 | 41.9 | 64.963 |
| 0.11244212962962963 | 41.9 | 64.963 |
| 0.11261574074074072 | 41.9 | 64.963 |
| 0.11278935185185185 | 41.9 | 64.963 |
| 0.11296296296296297 | 41.9 | 64.963 |
| 0.11314814814814815 | 41.9 | 64.963 |
| 0.11332175925925925 | 41.9 | 64.963 |
| 0.11349537037037037 | 41.9 | 64.963 |
| 0.11366898148148148 | 41.788 | 64.963 |
| 0.11384259259259259 | 41.9 | 64.963 |
| 0.1140162037037037 | 41.788 | 64.963 |
| 0.11420138888888888 | 41.9 | 65.075 |
| 0.114375 | 41.9 | 64.963 |
| 0.1145486111111111 | 41.9 | 65.075 |
| 0.11472222222222223 | 41.788 | 65.075 |
| 0.11489583333333335 | 41.9 | 65.188 |
| 0.11508101851851853 | 41.9 | 65.188 |
| 0.11525462962962962 | 41.9 | 65.3 |
| 0.11542824074074075 | 41.9 | 65.3 |
| 0.11560185185185186 | 41.9 | 65.412 |
| 0.11577546296296297 | 42.012 | 65.412 |
| 0.11594907407407407 | 41.9 | 65.412 |
| 0.11612268518518519 | 42.012 | 65.525 |
| 0.11630787037037038 | 41.9 | 65.638 |
| 0.11648148148148148 | 42.012 | 65.75 |
| 0.11665509259259259 | 42.012 | 65.862 |
| 0.1168287037037037 | 41.9 | 65.862 |
| 0.11700231481481482 | 42.012 | 65.862 |
| 0.11717592592592592 | 42.012 | 66.088 |
| 0.11734953703703704 | 42.012 | 66.088 |
| 0.11753472222222222 | 42.012 | 66.2 |
| 0.11770833333333335 | 42.012 | 66.312 |
| 0.11788194444444444 | 42.125 | 66.425 |
| 0.11805555555555557 | 42.125 | 66.425 |
| 0.11822916666666666 | 42.125 | 66.425 |
| 0.11840277777777779 | 42.125 | 66.312 |
| 0.11857638888888888 | 42.125 | 66.312 |
| 0.11876157407407407 | 42.125 | 66.312 |
| 0.11893518518518519 | 42.125 | 66.2 |
| 0.1191087962962963 | 42.125 | 66.088 |
| 0.1192824074074074 | 42.125 | 66.088 |
| 0.11945601851851852 | 42.125 | 66.088 |
| 0.11962962962962963 | 42.125 | 65.975 |
| 0.11980324074074074 | 42.238 | 65.975 |
| 0.11998842592592592 | 42.125 | 65.975 |
| 0.12016203703703704 | 42.125 | 65.862 |
| 0.12033564814814814 | 42.125 | 65.862 |
| 0.12050925925925926 | 42.238 | 65.862 |
| 0.12068287037037036 | 42.125 | 65.862 |
| 0.12085648148148148 | 42.125 | 65.75 |
| 0.12104166666666666 | 42.125 | 65.75 |
| 0.12121527777777778 | 42.125 | 65.75 |
| 0.12138888888888888 | 42.125 | 65.638 |
| 0.1215625 | 42.125 | 65.638 |
| 0.12173611111111111 | 42.125 | 65.638 |
| 0.12190972222222222 | 42.125 | 65.525 |
| 0.12209490740740742 | 42.125 | 65.525 |
| 0.12226851851851851 | 42.125 | 65.525 |
| 0.12244212962962964 | 42.125 | 65.525 |
| 0.12261574074074073 | 42.125 | 65.525 |
| 0.12278935185185186 | 42.125 | 65.412 |
| 0.12296296296296295 | 42.125 | 65.412 |
| 0.12313657407407408 | 42.012 | 65.412 |
| 0.12332175925925926 | 42.012 | 65.412 |
| 0.12349537037037038 | 42.012 | 65.412 |
| 0.12366898148148148 | 42.012 | 65.3 |
| 0.1238425925925926 | 42.012 | 65.3 |
| 0.1240162037037037 | 42.012 | 65.3 |
| 0.12418981481481482 | 42.012 | 65.3 |
| 0.124375 | 42.012 | 65.3 |
| 0.12454861111111111 | 42.012 | 65.3 |
| 0.12472222222222222 | 42.012 | 65.3 |
| 0.12489583333333333 | 41.9 | 65.3 |
| 0.12506944444444443 | 42.012 | 65.188 |
| 0.12524305555555557 | 42.012 | 65.188 |
| 0.12542824074074074 | 42.012 | 65.188 |
| 0.12560185185185185 | 41.9 | 65.188 |
| 0.12577546296296296 | 41.9 | 65.188 |
| 0.12594907407407407 | 41.9 | 65.188 |
| 0.12612268518518518 | 41.9 | 65.188 |
| 0.1262962962962963 | 41.9 | 65.188 |
| 0.1264699074074074 | 41.9 | 65.188 |
| 0.12665509259259258 | 41.9 | 65.188 |
| 0.12682870370370372 | 41.9 | 65.188 |
| 0.1270023148148148 | 41.788 | 65.188 |
| 0.12717592592592594 | 41.788 | 65.075 |
| 0.12734953703703702 | 41.788 | 65.188 |
| 0.12753472222222223 | 41.788 | 65.075 |
| 0.12770833333333334 | 41.788 | 65.075 |
| 0.12788194444444445 | 41.788 | 65.075 |
| 0.12805555555555556 | 41.788 | 65.075 |
| 0.12822916666666667 | 41.788 | 65.188 |
| 0.12840277777777778 | 41.788 | 65.075 |
| 0.1285763888888889 | 41.788 | 65.075 |
| 0.12876157407407407 | 41.788 | 65.075 |
| 0.12893518518518518 | 41.788 | 65.075 |
| 0.1291087962962963 | 41.788 | 65.075 |
| 0.1292824074074074 | 41.788 | 65.075 |
| 0.1294560185185185 | 41.788 | 65.075 |
| 0.12962962962962962 | 41.788 | 65.075 |
| 0.1298148148148148 | 41.788 | 65.075 |
| 0.12998842592592594 | 41.788 | 65.075 |
| 0.13016203703703702 | 41.788 | 65.075 |
| 0.13033564814814816 | 41.788 | 65.075 |
| 0.13050925925925924 | 41.675 | 65.075 |
| 0.13068287037037038 | 41.675 | 65.075 |
| 0.13086805555555556 | 41.675 | 65.075 |
| 0.13104166666666667 | 41.675 | 65.075 |
| 0.13121527777777778 | 41.675 | 65.075 |
| 0.1313888888888889 | 41.675 | 65.075 |
| 0.1315625 | 41.675 | 65.075 |
| 0.1317361111111111 | 41.675 | 65.075 |
| 0.13190972222222222 | 41.675 | 65.075 |
| 0.1320949074074074 | 41.675 | 65.075 |
| 0.13226851851851854 | 41.675 | 65.075 |
| 0.13244212962962962 | 41.675 | 65.075 |
| 0.13261574074074076 | 41.675 | 65.075 |
| 0.13278935185185184 | 41.675 | 65.075 |
| 0.13297453703703704 | 41.675 | 64.963 |
| 0.13314814814814815 | 41.675 | 65.075 |
| 0.13332175925925926 | 41.675 | 65.075 |
| 0.13349537037037038 | 41.675 | 65.075 |
| 0.13366898148148149 | 41.675 | 64.963 |
| 0.1338425925925926 | 41.675 | 64.963 |
| 0.1340162037037037 | 41.675 | 64.963 |
| 0.13420138888888888 | 41.675 | 64.963 |
| 0.134375 | 41.675 | 64.963 |
| 0.1345486111111111 | 41.675 | 64.963 |
| 0.13472222222222222 | 41.675 | 64.963 |
| 0.13489583333333333 | 41.675 | 65.075 |
| 0.13506944444444444 | 41.675 | 64.963 |
| 0.13524305555555555 | 41.675 | 64.963 |
| 0.13542824074074075 | 41.675 | 64.963 |
| 0.13560185185185183 | 41.562 | 64.963 |
| 0.13577546296296297 | 41.562 | 64.963 |
| 0.13594907407407408 | 41.562 | 64.963 |
| 0.1361226851851852 | 41.562 | 64.963 |
| 0.13630787037037037 | 41.562 | 64.963 |
| 0.13648148148148148 | 41.562 | 64.963 |
| 0.1366550925925926 | 41.562 | 64.963 |
| 0.1368287037037037 | 41.562 | 64.963 |
| 0.1370023148148148 | 41.562 | 64.963 |
| 0.13717592592592592 | 41.562 | 64.963 |
| 0.13734953703703703 | 41.562 | 64.963 |
| 0.1375347222222222 | 41.562 | 64.85 |
| 0.13770833333333335 | 41.562 | 64.85 |
| 0.13788194444444443 | 41.562 | 64.963 |
| 0.13805555555555557 | 41.562 | 64.85 |
| 0.13822916666666665 | 41.562 | 64.85 |
| 0.13841435185185186 | 41.562 | 64.85 |
| 0.13858796296296297 | 41.45 | 64.963 |
| 0.13876157407407408 | 41.45 | 64.85 |
| 0.1389351851851852 | 41.45 | 64.85 |
| 0.1391087962962963 | 41.45 | 64.85 |
| 0.1392824074074074 | 41.45 | 64.85 |
| 0.13945601851851852 | 41.45 | 64.85 |
| 0.1396412037037037 | 41.45 | 64.85 |
| 0.1398148148148148 | 41.45 | 64.85 |
| 0.13998842592592592 | 41.45 | 64.85 |
| 0.14016203703703703 | 41.45 | 64.963 |
| 0.14033564814814814 | 41.45 | 64.963 |
| 0.14052083333333334 | 41.45 | 64.963 |
| 0.14069444444444446 | 41.45 | 64.963 |
| 0.14086805555555557 | 41.45 | 64.963 |
| 0.14104166666666665 | 41.45 | 65.075 |
| 0.1412152777777778 | 41.45 | 65.075 |
| 0.1413888888888889 | 41.45 | 65.075 |
| 0.14157407407407407 | 41.45 | 65.188 |
| 0.14174768518518518 | 41.562 | 65.188 |
| 0.1419212962962963 | 41.562 | 65.3 |
| 0.1420949074074074 | 41.562 | 65.3 |
| 0.14226851851851852 | 41.562 | 65.412 |
| 0.14244212962962963 | 41.562 | 65.525 |
| 0.1426273148148148 | 41.562 | 65.638 |
| 0.14280092592592594 | 41.562 | 65.638 |
| 0.14297453703703702 | 41.675 | 65.75 |
| 0.14314814814814816 | 41.562 | 65.862 |
| 0.14332175925925925 | 41.675 | 65.862 |
| 0.14349537037037038 | 41.675 | 65.975 |
| 0.14368055555555556 | 41.675 | 66.088 |
| 0.14385416666666667 | 41.675 | 66.088 |
| 0.14402777777777778 | 41.675 | 66.2 |
| 0.1442013888888889 | 41.788 | 66.312 |
| 0.144375 | 41.788 | 66.312 |
| 0.1445486111111111 | 41.788 | 66.425 |
| 0.1447337962962963 | 41.788 | 66.425 |
| 0.1449074074074074 | 41.9 | 66.425 |
| 0.1450810185185185 | 41.9 | 66.312 |
| 0.14525462962962962 | 41.788 | 66.312 |
| 0.14542824074074076 | 41.788 | 66.2 |
| 0.14560185185185184 | 41.788 | 66.2 |
| 0.14578703703703702 | 41.788 | 66.088 |
| 0.14596064814814816 | 41.788 | 66.088 |
| 0.14613425925925927 | 41.788 | 65.975 |
| 0.14630787037037038 | 41.788 | 65.975 |
| 0.14648148148148146 | 41.788 | 65.862 |
| 0.1466550925925926 | 41.788 | 65.862 |
| 0.14684027777777778 | 41.788 | 65.862 |
| 0.1470138888888889 | 41.675 | 65.75 |
| 0.1471875 | 41.788 | 65.75 |
| 0.1473611111111111 | 41.788 | 65.75 |
| 0.14753472222222222 | 41.788 | 65.638 |
| 0.14770833333333333 | 41.788 | 65.638 |
| 0.14788194444444444 | 41.788 | 65.525 |
| 0.14806712962962962 | 41.788 | 65.638 |
| 0.14824074074074076 | 41.788 | 65.525 |
| 0.14841435185185184 | 41.675 | 65.525 |
| 0.14858796296296298 | 41.675 | 65.525 |
| 0.14876157407407406 | 41.675 | 65.412 |
| 0.14894675925925926 | 41.675 | 65.412 |
| 0.14912037037037038 | 41.675 | 65.412 |
| 0.14929398148148149 | 41.562 | 65.412 |
| 0.1494675925925926 | 41.562 | 65.3 |
| 0.1496412037037037 | 41.562 | 65.3 |
| 0.14981481481481482 | 41.562 | 65.3 |
| 0.14998842592592593 | 41.562 | 65.3 |
| 0.1501736111111111 | 41.562 | 65.3 |
| 0.15034722222222222 | 41.562 | 65.3 |
| 0.15052083333333333 | 41.562 | 65.3 |
| 0.15069444444444444 | 41.562 | 65.188 |
| 0.15086805555555557 | 41.562 | 65.188 |
| 0.15105324074074075 | 41.562 | 65.188 |
| 0.15122685185185183 | 41.45 | 65.188 |
| 0.15140046296296297 | 41.45 | 65.188 |
| 0.15157407407407408 | 41.45 | 65.188 |
| 0.1517476851851852 | 41.45 | 65.188 |
| 0.15192129629629628 | 41.45 | 65.188 |
| 0.15209490740740741 | 41.45 | 65.188 |
| 0.1522800925925926 | 41.45 | 65.075 |
| 0.1524537037037037 | 41.45 | 65.075 |
| 0.1526273148148148 | 41.45 | 65.075 |
| 0.15280092592592592 | 41.45 | 65.075 |
| 0.15297453703703703 | 41.45 | 65.075 |
| 0.15314814814814814 | 41.45 | 65.075 |
| 0.15333333333333332 | 41.45 | 65.075 |
| 0.15350694444444443 | 41.45 | 65.075 |
| 0.15368055555555557 | 41.338 | 65.075 |
| 0.15385416666666665 | 41.338 | 65.075 |
| 0.1540277777777778 | 41.338 | 64.963 |
| 0.15420138888888887 | 41.45 | 64.963 |
| 0.15438657407407408 | 41.338 | 64.963 |
| 0.1545601851851852 | 41.338 | 64.963 |
| 0.1547337962962963 | 41.338 | 64.963 |
| 0.1549074074074074 | 41.338 | 65.075 |
| 0.15508101851851852 | 41.338 | 65.075 |
| 0.15525462962962963 | 41.338 | 64.963 |
| 0.15542824074074074 | 41.338 | 64.963 |
| 0.15561342592592595 | 41.338 | 64.963 |
| 0.15578703703703703 | 41.225 | 64.963 |
| 0.15596064814814814 | 41.225 | 64.963 |
| 0.15613425925925925 | 41.225 | 64.963 |
| 0.1563078703703704 | 41.225 | 64.963 |
| 0.15648148148148147 | 41.225 | 64.963 |
| 0.15666666666666665 | 41.225 | 64.963 |
| 0.1568402777777778 | 41.225 | 64.963 |
| 0.1570138888888889 | 41.225 | 64.963 |
| 0.1571875 | 41.225 | 64.963 |
| 0.15736111111111112 | 41.225 | 64.963 |
| 0.15753472222222223 | 41.225 | 64.963 |
| 0.1577199074074074 | 41.225 | 64.963 |
| 0.15789351851851852 | 41.112 | 64.963 |
| 0.15806712962962963 | 41.225 | 64.85 |
| 0.15824074074074074 | 41.112 | 64.85 |
| 0.15841435185185185 | 41.112 | 64.85 |
| 0.15858796296296296 | 41.112 | 64.85 |
| 0.15877314814814816 | 41.112 | 64.963 |
| 0.15894675925925925 | 41.112 | 64.85 |
| 0.15912037037037038 | 41.112 | 64.963 |
| 0.15929398148148147 | 41.112 | 64.85 |
| 0.1594675925925926 | 41.112 | 64.85 |
| 0.1596412037037037 | 41.112 | 64.85 |
| 0.15981481481481483 | 41.112 | 64.85 |
| 0.16 | 41.112 | 64.85 |
| 0.1601736111111111 | 41.112 | 64.85 |
| 0.16034722222222222 | 41.112 | 64.85 |
| 0.16052083333333333 | 41.112 | 64.85 |
| 0.16069444444444445 | 41 | 64.85 |
| 0.16087962962962962 | 41 | 64.85 |
| 0.16105324074074073 | 41 | 64.85 |
| 0.16122685185185184 | 41 | 64.85 |
| 0.16140046296296295 | 41 | 64.85 |
| 0.16157407407407406 | 41 | 64.85 |
| 0.1617476851851852 | 41 | 64.85 |
| 0.16193287037037038 | 41 | 64.85 |
| 0.16210648148148146 | 41 | 64.738 |
| 0.1622800925925926 | 41 | 64.738 |
| 0.1624537037037037 | 41 | 64.738 |
| 0.16262731481481482 | 41 | 64.738 |
| 0.1628125 | 41 | 64.738 |
| 0.1629861111111111 | 41 | 64.738 |
| 0.16315972222222222 | 41 | 64.738 |
| 0.16333333333333333 | 40.888 | 64.738 |
| 0.16350694444444444 | 40.888 | 64.738 |
| 0.16368055555555555 | 40.888 | 64.738 |
| 0.16385416666666666 | 40.888 | 64.738 |
| 0.16403935185185184 | 40.888 | 64.738 |
| 0.16421296296296298 | 40.888 | 64.738 |
| 0.16438657407407406 | 40.888 | 64.738 |
| 0.1645601851851852 | 40.775 | 64.85 |
| 0.16473379629629628 | 40.888 | 64.738 |
| 0.16490740740740742 | 40.888 | 64.85 |
| 0.1650925925925926 | 40.888 | 64.85 |
| 0.1652662037037037 | 40.888 | 64.963 |
| 0.16543981481481482 | 40.888 | 64.963 |
| 0.16561342592592593 | 40.888 | 64.963 |
| 0.16578703703703704 | 40.888 | 64.963 |
| 0.16596064814814815 | 40.888 | 65.075 |
| 0.16614583333333333 | 40.888 | 65.075 |
| 0.16631944444444444 | 40.888 | 65.075 |
| 0.16649305555555557 | 41 | 65.188 |
| 0.16666666666666666 | 40.888 | 65.188 |
| 0.16684027777777777 | 41 | 65.3 |
| 0.1670138888888889 | 41 | 65.412 |
| 0.16718750000000002 | 41 | 65.525 |
| 0.1673726851851852 | 41 | 65.638 |
| 0.16754629629629628 | 41.112 | 65.638 |
| 0.16771990740740741 | 41.112 | 65.75 |
| 0.16789351851851853 | 41.112 | 65.862 |
| 0.16806712962962964 | 41.112 | 65.862 |
| 0.16824074074074072 | 41.112 | 65.975 |
| 0.16842592592592595 | 41.112 | 66.088 |
| 0.16859953703703703 | 41.112 | 66.088 |
| 0.16877314814814814 | 41.112 | 66.2 |
| 0.16894675925925925 | 41.225 | 66.2 |
| 0.1691203703703704 | 41.225 | 66.312 |
| 0.16929398148148148 | 41.225 | 66.312 |
| 0.1694675925925926 | 41.225 | 66.312 |
| 0.16965277777777776 | 41.225 | 66.2 |
| 0.1698263888888889 | 41.225 | 66.2 |
| 0.17 | 41.225 | 66.088 |
| 0.1701736111111111 | 41.225 | 65.975 |
| 0.1703472222222222 | 41.225 | 65.975 |
| 0.17052083333333334 | 41.225 | 65.975 |
| 0.17069444444444445 | 41.225 | 65.862 |
| 0.17087962962962963 | 41.225 | 65.862 |
| 0.17105324074074071 | 41.225 | 65.75 |
| 0.17122685185185185 | 41.225 | 65.75 |
| 0.17140046296296296 | 41.225 | 65.75 |
| 0.17157407407407407 | 41.225 | 65.638 |
| 0.1717476851851852 | 41.225 | 65.638 |
| 0.1719328703703704 | 41.112 | 65.525 |
| 0.17210648148148147 | 41.225 | 65.638 |
| 0.17228009259259258 | 41.112 | 65.525 |
| 0.17245370370370372 | 41.112 | 65.412 |
| 0.17262731481481483 | 41.112 | 65.412 |
| 0.1728009259259259 | 41.112 | 65.412 |
| 0.17297453703703702 | 41.112 | 65.3 |
| 0.17315972222222223 | 41.112 | 65.3 |
| 0.17333333333333334 | 41.112 | 65.3 |
| 0.17350694444444445 | 41.112 | 65.3 |
| 0.17368055555555553 | 41.112 | 65.3 |
| 0.17385416666666667 | 41 | 65.188 |
| 0.17402777777777778 | 41 | 65.188 |
| 0.17421296296296296 | 41 | 65.188 |
| 0.17438657407407407 | 41 | 65.188 |
| 0.1745601851851852 | 41 | 65.188 |
| 0.1747337962962963 | 41.112 | 65.188 |
| 0.1749074074074074 | 41 | 65.075 |
| 0.1750810185185185 | 41 | 65.075 |
| 0.17525462962962965 | 40.888 | 65.075 |
| 0.17542824074074073 | 41 | 65.075 |
| 0.1756134259259259 | 41 | 65.075 |
| 0.17578703703703702 | 40.888 | 65.075 |
| 0.17596064814814816 | 41 | 65.075 |
| 0.17613425925925927 | 41 | 65.075 |
| 0.17630787037037035 | 40.888 | 64.963 |
| 0.1764814814814815 | 40.888 | 64.963 |
| 0.17666666666666667 | 40.888 | 65.075 |
| 0.17684027777777778 | 40.888 | 64.963 |
| 0.1770138888888889 | 40.888 | 64.963 |
| 0.17718750000000003 | 40.888 | 64.963 |
| 0.1773611111111111 | 40.888 | 64.963 |
| 0.17753472222222222 | 40.888 | 64.963 |
| 0.17770833333333333 | 40.888 | 64.963 |
| 0.17789351851851853 | 40.888 | 64.963 |
| 0.17806712962962964 | 40.775 | 64.963 |
| 0.17824074074074073 | 40.775 | 64.963 |
| 0.17841435185185184 | 40.775 | 64.963 |
| 0.17858796296296298 | 40.775 | 64.963 |
| 0.1787615740740741 | 40.775 | 64.85 |
| 0.17894675925925926 | 40.775 | 64.963 |
| 0.17912037037037035 | 40.775 | 64.85 |
| 0.17929398148148148 | 40.775 | 64.85 |
| 0.1794675925925926 | 40.662 | 64.85 |
| 0.1796412037037037 | 40.775 | 64.85 |
| 0.1798148148148148 | 40.662 | 64.85 |
| 0.17998842592592593 | 40.662 | 64.85 |
| 0.1801736111111111 | 40.662 | 64.85 |
| 0.18034722222222221 | 40.662 | 64.85 |
| 0.18052083333333332 | 40.662 | 64.85 |
| 0.18069444444444446 | 40.662 | 64.85 |
| 0.18086805555555555 | 40.662 | 64.85 |
| 0.18104166666666666 | 40.662 | 64.85 |
| 0.18122685185185183 | 40.55 | 64.85 |
| 0.18140046296296297 | 40.55 | 64.85 |
| 0.18157407407407408 | 40.55 | 64.85 |
| 0.18174768518518516 | 40.55 | 64.85 |
| 0.1819212962962963 | 40.55 | 64.85 |
| 0.1820949074074074 | 40.55 | 64.738 |
| 0.1822800925925926 | 40.55 | 64.738 |
| 0.1824537037037037 | 40.55 | 64.738 |
| 0.18262731481481484 | 40.55 | 64.738 |
| 0.18280092592592592 | 40.55 | 64.738 |
| 0.18297453703703703 | 40.438 | 64.738 |
| 0.18314814814814814 | 40.438 | 64.738 |
| 0.18333333333333335 | 40.438 | 64.738 |
| 0.18350694444444446 | 40.55 | 64.738 |
| 0.18368055555555554 | 40.438 | 64.738 |
| 0.18385416666666665 | 40.438 | 64.738 |
| 0.1840277777777778 | 40.438 | 64.738 |
| 0.18421296296296297 | 40.438 | 64.738 |
| 0.18438657407407408 | 40.438 | 64.738 |
| 0.18456018518518516 | 40.438 | 64.738 |
| 0.1847337962962963 | 40.325 | 64.738 |
| 0.1849074074074074 | 40.325 | 64.625 |
| 0.18508101851851852 | 40.325 | 64.738 |
| 0.1852546296296296 | 40.438 | 64.738 |
| 0.18543981481481484 | 40.325 | 64.625 |
| 0.18561342592592592 | 40.325 | 64.625 |
| 0.18578703703703703 | 40.212 | 64.625 |
| 0.18596064814814817 | 40.212 | 64.625 |
| 0.18614583333333334 | 40.325 | 64.625 |
| 0.18631944444444445 | 40.325 | 64.625 |
| 0.18649305555555554 | 40.325 | 64.625 |
| 0.18666666666666668 | 40.212 | 64.625 |
| 0.18684027777777779 | 40.212 | 64.625 |
| 0.1870138888888889 | 40.212 | 64.625 |
| 0.18718749999999998 | 40.212 | 64.625 |
| 0.1873726851851852 | 40.212 | 64.625 |
| 0.1875462962962963 | 40.212 | 64.625 |
| 0.1877199074074074 | 40.212 | 64.625 |
| 0.18789351851851852 | 40.212 | 64.625 |
| 0.18806712962962965 | 40.212 | 64.625 |
| 0.18825231481481483 | 40.212 | 64.738 |
| 0.1884259259259259 | 40.212 | 64.738 |
| 0.18859953703703702 | 40.212 | 64.738 |
| 0.18877314814814816 | 40.212 | 64.738 |
| 0.18894675925925927 | 40.212 | 64.738 |
| 0.18912037037037036 | 40.212 | 64.85 |
| 0.18930555555555553 | 40.212 | 64.85 |
| 0.18947916666666667 | 40.212 | 64.85 |
| 0.18965277777777778 | 40.212 | 64.963 |
| 0.1898263888888889 | 40.212 | 64.963 |
| 0.19000000000000003 | 40.212 | 65.075 |
| 0.1901736111111111 | 40.325 | 65.075 |
| 0.19034722222222222 | 40.212 | 65.188 |
| 0.1905324074074074 | 40.325 | 65.3 |
| 0.19070601851851854 | 40.325 | 65.3 |
| 0.19087962962962965 | 40.325 | 65.412 |
| 0.19105324074074073 | 40.325 | 65.412 |
| 0.19122685185185184 | 40.325 | 65.638 |
| 0.19140046296296295 | 40.325 | 65.638 |
| 0.19158564814814816 | 40.325 | 65.75 |
| 0.19175925925925927 | 40.325 | 65.862 |
| 0.19193287037037035 | 40.438 | 65.862 |
| 0.19210648148148146 | 40.438 | 65.975 |
| 0.1922800925925926 | 40.438 | 66.088 |
| 0.1924537037037037 | 40.55 | 66.2 |
| 0.1926388888888889 | 40.55 | 66.2 |
| 0.19281249999999997 | 40.55 | 66.2 |
| 0.1929861111111111 | 40.438 | 66.312 |
| 0.19315972222222222 | 40.438 | 66.312 |
| 0.19333333333333333 | 40.55 | 66.2 |
| 0.19350694444444447 | 40.55 | 66.2 |
| 0.19368055555555555 | 40.55 | 66.088 |
| 0.19386574074074073 | 40.55 | 66.088 |
| 0.19403935185185184 | 40.55 | 65.975 |
| 0.19421296296296298 | 40.438 | 65.975 |
| 0.1943865740740741 | 40.438 | 65.862 |
| 0.19456018518518517 | 40.55 | 65.75 |
| 0.19474537037037035 | 40.55 | 65.75 |
| 0.19491898148148148 | 40.55 | 65.75 |
| 0.1950925925925926 | 40.438 | 65.638 |
| 0.1952662037037037 | 40.438 | 65.638 |
| 0.1954398148148148 | 40.438 | 65.525 |
| 0.19561342592592593 | 40.438 | 65.525 |
| 0.19578703703703704 | 40.438 | 65.525 |
| 0.19597222222222221 | 40.438 | 65.412 |
| 0.19614583333333332 | 40.438 | 65.412 |
| 0.19631944444444446 | 40.438 | 65.412 |
| 0.19649305555555555 | 40.438 | 65.3 |
| 0.19666666666666666 | 40.325 | 65.3 |
| 0.1968402777777778 | 40.325 | 65.3 |
| 0.1970138888888889 | 40.325 | 65.188 |
| 0.19719907407407408 | 40.438 | 65.188 |
| 0.19737268518518516 | 40.438 | 65.188 |
| 0.1975462962962963 | 40.325 | 65.188 |
| 0.1977199074074074 | 40.325 | 65.188 |
| 0.19789351851851852 | 40.325 | 65.075 |
| 0.1980671296296296 | 40.325 | 65.075 |
| 0.19825231481481484 | 40.325 | 65.075 |
| 0.19842592592592592 | 40.325 | 65.075 |
| 0.19859953703703703 | 40.325 | 65.075 |
| 0.19877314814814814 | 40.212 | 65.075 |
| 0.19894675925925928 | 40.212 | 64.963 |
| 0.19912037037037036 | 40.212 | 64.963 |
| 0.19929398148148147 | 40.212 | 64.963 |
| 0.19947916666666665 | 40.212 | 64.963 |
| 0.1996527777777778 | 40.212 | 64.963 |
| 0.1998263888888889 | 40.212 | 64.963 |
| 0.19999999999999998 | 40.212 | 64.963 |
| 0.20017361111111112 | 40.212 | 64.963 |
| 0.20034722222222223 | 40.212 | 64.85 |
| 0.2005324074074074 | 40.212 | 64.85 |
| 0.20070601851851852 | 40.212 | 64.85 |
| 0.20087962962962966 | 40.1 | 64.85 |
| 0.20105324074074074 | 40.1 | 64.85 |
| 0.20122685185185185 | 40.1 | 64.85 |
| 0.20140046296296296 | 40.1 | 64.85 |
| 0.20158564814814817 | 40.1 | 64.85 |
| 0.20175925925925928 | 40.1 | 64.85 |
| 0.20193287037037036 | 40.1 | 64.85 |
| 0.20210648148148147 | 40.1 | 64.738 |
| 0.20228009259259258 | 39.988 | 64.738 |
| 0.20245370370370372 | 39.988 | 64.738 |
| 0.2026388888888889 | 39.988 | 64.738 |
| 0.20281249999999998 | 39.988 | 64.738 |
| 0.2029861111111111 | 39.988 | 64.738 |
| 0.20315972222222223 | 39.988 | 64.738 |
| 0.20333333333333334 | 39.988 | 64.738 |
| 0.20350694444444442 | 39.988 | 64.738 |
| 0.20369212962962965 | 39.988 | 64.738 |
| 0.20386574074074074 | 39.988 | 64.738 |
| 0.20403935185185185 | 39.988 | 64.625 |
| 0.20421296296296299 | 39.875 | 64.738 |
| 0.2043865740740741 | 39.875 | 64.625 |
| 0.20456018518518518 | 39.875 | 64.625 |
| 0.20474537037037036 | 39.875 | 64.625 |
| 0.2049189814814815 | 39.875 | 64.625 |
| 0.2050925925925926 | 39.875 | 64.625 |
| 0.20526620370370371 | 39.875 | 64.625 |
| 0.2054398148148148 | 39.875 | 64.625 |
| 0.2056134259259259 | 39.875 | 64.625 |
| 0.2057986111111111 | 39.875 | 64.625 |
| 0.20597222222222222 | 39.875 | 64.625 |
| 0.20614583333333333 | 39.875 | 64.625 |
| 0.20631944444444442 | 39.762 | 64.625 |
| 0.20649305555555555 | 39.875 | 64.625 |
| 0.20666666666666667 | 39.762 | 64.625 |
| 0.20685185185185184 | 39.762 | 64.625 |
| 0.20702546296296295 | 39.762 | 64.625 |
| 0.2071990740740741 | 39.762 | 64.625 |
| 0.20737268518518517 | 39.762 | 64.512 |
| 0.20754629629629628 | 39.762 | 64.625 |
| 0.20771990740740742 | 39.762 | 64.512 |
| 0.20789351851851853 | 39.762 | 64.512 |
| 0.2080787037037037 | 39.65 | 64.512 |
| 0.2082523148148148 | 39.762 | 64.512 |
| 0.20842592592592593 | 39.65 | 64.512 |
| 0.20859953703703704 | 39.65 | 64.512 |
| 0.20877314814814815 | 39.65 | 64.512 |
| 0.20894675925925923 | 39.65 | 64.512 |
| 0.20913194444444447 | 39.65 | 64.512 |
| 0.20930555555555555 | 39.65 | 64.512 |
| 0.20947916666666666 | 39.65 | 64.512 |
| 0.20965277777777777 | 39.65 | 64.512 |
| 0.2098263888888889 | 39.65 | 64.512 |
| 0.2100115740740741 | 39.65 | 64.512 |
| 0.21018518518518517 | 39.65 | 64.512 |
| 0.21035879629629628 | 39.538 | 64.512 |
| 0.21053240740740742 | 39.65 | 64.512 |
| 0.21070601851851853 | 39.538 | 64.512 |
| 0.2108796296296296 | 39.538 | 64.512 |
| 0.21105324074074075 | 39.538 | 64.512 |
| 0.21123842592592593 | 39.538 | 64.512 |
| 0.21141203703703704 | 39.538 | 64.512 |
| 0.21158564814814815 | 39.538 | 64.625 |
| 0.21175925925925929 | 39.538 | 64.625 |
| 0.21193287037037037 | 39.538 | 64.625 |
| 0.21210648148148148 | 39.538 | 64.738 |
| 0.21229166666666666 | 39.65 | 64.738 |
| 0.2124652777777778 | 39.65 | 64.738 |
| 0.2126388888888889 | 39.65 | 64.85 |
| 0.2128125 | 39.65 | 64.85 |
| 0.2129861111111111 | 39.65 | 64.963 |
| 0.21315972222222224 | 39.65 | 64.963 |
| 0.2133449074074074 | 39.65 | 65.075 |
| 0.21351851851851852 | 39.762 | 65.188 |
| 0.2136921296296296 | 39.762 | 65.3 |
| 0.21386574074074075 | 39.762 | 65.3 |
| 0.21403935185185186 | 39.762 | 65.3 |
| 0.21422453703703703 | 39.762 | 65.412 |
| 0.21439814814814814 | 39.762 | 65.525 |
| 0.21457175925925928 | 39.875 | 65.525 |
| 0.21474537037037036 | 39.875 | 65.75 |
| 0.21491898148148147 | 39.762 | 65.75 |
| 0.21509259259259259 | 39.875 | 65.862 |
| 0.2152777777777778 | 39.875 | 65.975 |
| 0.2154513888888889 | 39.875 | 65.975 |
| 0.21562499999999998 | 39.875 | 66.088 |
| 0.2157986111111111 | 39.875 | 66.088 |
| 0.21597222222222223 | 39.988 | 66.2 |
| 0.21614583333333334 | 39.988 | 66.2 |
| 0.21631944444444443 | 39.988 | 66.2 |
| 0.21650462962962966 | 39.988 | 66.088 |
| 0.21667824074074074 | 39.988 | 65.975 |
| 0.21685185185185185 | 39.988 | 65.975 |
| 0.21702546296296296 | 39.875 | 65.862 |
| 0.2171990740740741 | 39.988 | 65.862 |
| 0.21738425925925928 | 39.988 | 65.862 |
| 0.21755787037037036 | 39.988 | 65.75 |
| 0.21773148148148147 | 39.988 | 65.75 |
| 0.2179050925925926 | 39.988 | 65.638 |
| 0.21807870370370372 | 39.988 | 65.638 |
| 0.2182523148148148 | 39.988 | 65.638 |
| 0.2184259259259259 | 39.988 | 65.525 |
| 0.21861111111111112 | 39.988 | 65.525 |
| 0.21878472222222223 | 39.988 | 65.412 |
| 0.21895833333333334 | 39.988 | 65.3 |
| 0.21913194444444442 | 39.875 | 65.3 |
| 0.21930555555555556 | 39.875 | 65.3 |
| 0.21947916666666667 | 39.875 | 65.3 |
| 0.21966435185185185 | 39.875 | 65.188 |
| 0.21983796296296296 | 39.875 | 65.188 |
| 0.2200115740740741 | 39.875 | 65.188 |
| 0.22018518518518518 | 39.988 | 65.075 |
| 0.2203587962962963 | 39.875 | 65.075 |
| 0.2205324074074074 | 39.875 | 65.075 |
| 0.22070601851851854 | 39.875 | 64.963 |
| 0.22089120370370371 | 39.762 | 65.075 |
| 0.2210648148148148 | 39.875 | 64.963 |
| 0.2212384259259259 | 39.762 | 64.963 |
| 0.22141203703703705 | 39.762 | 64.963 |
| 0.22158564814814816 | 39.762 | 64.85 |
| 0.22175925925925924 | 39.762 | 64.85 |
| 0.22194444444444447 | 39.762 | 64.85 |
| 0.22211805555555555 | 39.762 | 64.85 |
| 0.22229166666666667 | 39.762 | 64.85 |
| 0.22246527777777778 | 39.762 | 64.738 |
| 0.22263888888888891 | 39.762 | 64.85 |
| 0.2228125 | 39.65 | 64.738 |
| 0.2229861111111111 | 39.65 | 64.85 |
| 0.22317129629629628 | 39.65 | 64.738 |
| 0.22334490740740742 | 39.65 | 64.738 |
| 0.22351851851851853 | 39.65 | 64.738 |
| 0.22369212962962962 | 39.65 | 64.738 |
| 0.22386574074074073 | 39.65 | 64.738 |
| 0.22403935185185186 | 39.65 | 64.738 |
| 0.22422453703703704 | 39.65 | 64.738 |
| 0.22439814814814815 | 39.65 | 64.738 |
| 0.22457175925925923 | 39.65 | 64.738 |
| 0.22474537037037037 | 39.65 | 64.738 |
| 0.22493055555555555 | 39.538 | 64.738 |
| 0.22510416666666666 | 39.538 | 64.738 |
| 0.22527777777777777 | 39.538 | 64.738 |
| 0.2254513888888889 | 39.538 | 64.625 |
| 0.225625 | 39.538 | 64.738 |
| 0.2257986111111111 | 39.425 | 64.738 |
| 0.22598379629629628 | 39.538 | 64.625 |
| 0.22615740740740742 | 39.538 | 64.625 |
| 0.22633101851851853 | 39.425 | 64.625 |
| 0.2265046296296296 | 39.538 | 64.625 |
| 0.22667824074074075 | 39.425 | 64.738 |
| 0.22685185185185186 | 39.425 | 64.625 |
| 0.22703703703703704 | 39.425 | 64.625 |
| 0.22721064814814815 | 39.425 | 64.625 |
| 0.22738425925925929 | 39.425 | 64.625 |
| 0.22755787037037037 | 39.425 | 64.625 |
| 0.22773148148148148 | 39.425 | 64.625 |
| 0.2279050925925926 | 39.425 | 64.625 |
| 0.2280902777777778 | 39.425 | 64.625 |
| 0.2282638888888889 | 39.425 | 64.512 |
| 0.2284375 | 39.425 | 64.625 |
| 0.2286111111111111 | 39.425 | 64.625 |
| 0.22878472222222224 | 39.425 | 64.625 |
| 0.22895833333333335 | 39.425 | 64.512 |
| 0.22914351851851852 | 39.425 | 64.512 |
| 0.2293171296296296 | 39.425 | 64.512 |
| 0.22949074074074075 | 39.312 | 64.512 |
| 0.22966435185185186 | 39.312 | 64.512 |
| 0.22983796296296297 | 39.425 | 64.512 |
| 0.23001157407407405 | 39.312 | 64.512 |
| 0.23019675925925928 | 39.312 | 64.512 |
| 0.23037037037037036 | 39.312 | 64.512 |
| 0.23054398148148147 | 39.312 | 64.512 |
| 0.2307175925925926 | 39.312 | 64.4 |
| 0.23089120370370372 | 39.312 | 64.4 |
| 0.2310648148148148 | 39.312 | 64.4 |
| 0.23124999999999998 | 39.312 | 64.4 |
| 0.23142361111111112 | 39.312 | 64.4 |
| 0.23159722222222223 | 39.312 | 64.4 |
| 0.23177083333333334 | 39.312 | 64.4 |
| 0.23194444444444443 | 39.312 | 64.4 |
| 0.23212962962962966 | 39.312 | 64.4 |
| 0.23230324074074074 | 39.312 | 64.4 |
| 0.23247685185185185 | 39.312 | 64.4 |
| 0.23265046296296296 | 39.312 | 64.4 |
| 0.23282407407407404 | 39.312 | 64.4 |
| 0.23299768518518518 | 39.312 | 64.4 |
| 0.23318287037037036 | 39.312 | 64.4 |
| 0.23335648148148147 | 39.2 | 64.512 |
| 0.23353009259259258 | 39.312 | 64.512 |
| 0.23370370370370372 | 39.312 | 64.512 |
| 0.2338773148148148 | 39.312 | 64.625 |
| 0.23406249999999998 | 39.312 | 64.625 |
| 0.2342361111111111 | 39.312 | 64.625 |
| 0.23440972222222223 | 39.312 | 64.625 |
| 0.23458333333333334 | 39.312 | 64.738 |
| 0.23475694444444442 | 39.425 | 64.738 |
| 0.23493055555555556 | 39.425 | 64.85 |
| 0.23510416666666667 | 39.425 | 64.85 |
| 0.23528935185185185 | 39.425 | 64.963 |
| 0.23546296296296299 | 39.425 | 65.075 |
| 0.2356365740740741 | 39.425 | 65.188 |
| 0.23581018518518518 | 39.425 | 65.188 |
| 0.2359837962962963 | 39.538 | 65.3 |
| 0.2361574074074074 | 39.538 | 65.412 |
| 0.2363425925925926 | 39.538 | 65.525 |
| 0.23651620370370371 | 39.538 | 65.525 |
| 0.2366898148148148 | 39.65 | 65.638 |
| 0.2368634259259259 | 39.538 | 65.75 |
| 0.23703703703703705 | 39.65 | 65.75 |
| 0.23721064814814816 | 39.65 | 65.862 |
| 0.23739583333333333 | 39.65 | 65.975 |
| 0.23756944444444442 | 39.65 | 66.088 |
| 0.23774305555555555 | 39.65 | 66.088 |
| 0.23791666666666667 | 39.65 | 66.2 |
| 0.23809027777777778 | 39.762 | 66.2 |
| 0.23826388888888891 | 39.762 | 66.312 |
| 0.2384490740740741 | 39.762 | 66.2 |
| 0.23862268518518517 | 39.762 | 66.2 |
| 0.23879629629629628 | 39.65 | 66.088 |
| 0.23896990740740742 | 39.65 | 65.975 |
| 0.23914351851851853 | 39.65 | 65.975 |
| 0.23931712962962962 | 39.762 | 65.862 |
| 0.2395023148148148 | 39.762 | 65.75 |
| 0.23967592592592593 | 39.65 | 65.75 |
| 0.23984953703703704 | 39.762 | 65.638 |
| 0.24002314814814815 | 39.65 | 65.638 |
| 0.24019675925925923 | 39.65 | 65.525 |
| 0.24037037037037037 | 39.65 | 65.525 |
| 0.24055555555555555 | 39.65 | 65.525 |
| 0.24072916666666666 | 39.65 | 65.412 |
| 0.24090277777777777 | 39.762 | 65.412 |
| 0.2410763888888889 | 39.65 | 65.412 |
| 0.24125 | 39.65 | 65.3 |
| 0.2414236111111111 | 39.762 | 65.188 |
| 0.24159722222222224 | 39.762 | 65.188 |
| 0.24178240740740742 | 39.65 | 65.188 |
| 0.24195601851851853 | 39.65 | 65.075 |
| 0.2421296296296296 | 39.762 | 65.188 |
| 0.24230324074074075 | 39.762 | 65.075 |
| 0.24247685185185186 | 39.65 | 65.075 |
| 0.24266203703703704 | 39.65 | 65.075 |
| 0.24283564814814815 | 39.65 | 64.963 |
| 0.24300925925925929 | 39.65 | 65.075 |
| 0.24318287037037037 | 39.65 | 64.963 |
| 0.24335648148148148 | 39.65 | 64.963 |
| 0.2435300925925926 | 39.65 | 64.85 |
| 0.2437152777777778 | 39.65 | 64.85 |
| 0.2438888888888889 | 39.65 | 64.85 |
| 0.2440625 | 39.65 | 64.85 |
| 0.2442361111111111 | 39.65 | 64.85 |
| 0.24440972222222224 | 39.538 | 64.85 |
| 0.24458333333333335 | 39.538 | 64.738 |
| 0.24475694444444443 | 39.538 | 64.85 |
| 0.2449421296296296 | 39.538 | 64.738 |
| 0.24511574074074075 | 39.538 | 64.738 |
| 0.24528935185185186 | 39.538 | 64.738 |
| 0.24546296296296297 | 39.538 | 64.738 |
| 0.2456365740740741 | 39.538 | 64.738 |
| 0.24582175925925928 | 39.538 | 64.738 |
| 0.24599537037037036 | 39.538 | 64.625 |
| 0.24616898148148147 | 39.538 | 64.738 |
| 0.2463425925925926 | 39.538 | 64.625 |
| 0.24651620370370372 | 39.538 | 64.738 |
| 0.2466898148148148 | 39.425 | 64.738 |
| 0.24687499999999998 | 39.538 | 64.625 |
| 0.24704861111111112 | 39.538 | 64.625 |
| 0.24722222222222223 | 39.538 | 64.625 |
| 0.24739583333333334 | 39.538 | 64.625 |
| 0.24756944444444443 | 39.538 | 64.625 |
| 0.24774305555555554 | 39.538 | 64.625 |
| 0.24791666666666667 | 39.538 | 64.512 |
| 0.24810185185185185 | 39.425 | 64.512 |
| 0.24827546296296296 | 39.538 | 64.512 |
| 0.24844907407407404 | 39.538 | 64.512 |
| 0.24862268518518518 | 39.425 | 64.512 |
| 0.2487962962962963 | 39.425 | 64.512 |
| 0.2489699074074074 | 39.425 | 64.512 |
| 0.24915509259259258 | 39.425 | 64.512 |
| 0.24932870370370372 | 39.425 | 64.512 |
| 0.2495023148148148 | 39.425 | 64.512 |
| 0.2496759259259259 | 39.425 | 64.512 |
| 0.24984953703703705 | 39.425 | 64.512 |
| 0.25002314814814813 | 39.425 | 64.512 |
| 0.25019675925925927 | 39.425 | 64.512 |
| 0.25038194444444445 | 39.425 | 64.4 |
| 0.2505555555555556 | 39.425 | 64.512 |
| 0.25072916666666667 | 39.425 | 64.4 |
| 0.25090277777777775 | 39.312 | 64.4 |
| 0.2510763888888889 | 39.312 | 64.4 |
| 0.25125000000000003 | 39.312 | 64.4 |
| 0.2514351851851852 | 39.312 | 64.4 |
| 0.2516087962962963 | 39.312 | 64.4 |
| 0.25178240740740737 | 39.312 | 64.4 |
| 0.2519560185185185 | 39.312 | 64.4 |
| 0.25212962962962965 | 39.312 | 64.4 |
| 0.25230324074074073 | 39.312 | 64.4 |
| 0.25247685185185187 | 39.312 | 64.4 |
| 0.25266203703703705 | 39.312 | 64.4 |
| 0.25283564814814813 | 39.312 | 64.4 |
| 0.25300925925925927 | 39.312 | 64.4 |
| 0.2531828703703704 | 39.2 | 64.4 |
| 0.2533564814814815 | 39.312 | 64.4 |
| 0.25353009259259257 | 39.2 | 64.4 |
| 0.25371527777777775 | 39.312 | 64.4 |
| 0.2538888888888889 | 39.312 | 64.4 |
| 0.2540625 | 39.312 | 64.287 |
| 0.2542361111111111 | 39.312 | 64.287 |
| 0.2544097222222222 | 39.312 | 64.287 |
| 0.25458333333333333 | 39.312 | 64.287 |
| 0.25475694444444447 | 39.312 | 64.287 |
| 0.25494212962962964 | 39.312 | 64.287 |
| 0.2551157407407407 | 39.312 | 64.287 |
| 0.25528935185185186 | 39.312 | 64.4 |
| 0.25546296296296295 | 39.312 | 64.4 |
| 0.2556365740740741 | 39.312 | 64.4 |
| 0.25581018518518517 | 39.312 | 64.4 |
| 0.2559837962962963 | 39.312 | 64.512 |
| 0.2561689814814815 | 39.312 | 64.512 |
| 0.25634259259259257 | 39.312 | 64.512 |
| 0.2565162037037037 | 39.312 | 64.625 |
| 0.25668981481481484 | 39.425 | 64.625 |
| 0.2568634259259259 | 39.425 | 64.738 |
| 0.257037037037037 | 39.425 | 64.738 |
| 0.25722222222222224 | 39.425 | 64.85 |
| 0.2573958333333333 | 39.425 | 64.963 |
| 0.25756944444444446 | 39.538 | 65.075 |
| 0.25774305555555554 | 39.538 | 65.075 |
| 0.2579166666666667 | 39.538 | 65.075 |
| 0.25809027777777777 | 39.538 | 65.3 |
| 0.25827546296296294 | 39.538 | 65.3 |
| 0.2584490740740741 | 39.538 | 65.525 |
| 0.2586226851851852 | 39.65 | 65.525 |
| 0.2587962962962963 | 39.65 | 65.638 |
| 0.2589699074074074 | 39.65 | 65.75 |
| 0.25915509259259256 | 39.65 | 65.75 |
| 0.2593287037037037 | 39.762 | 65.862 |
| 0.25950231481481484 | 39.762 | 65.862 |
| 0.2596759259259259 | 39.762 | 65.975 |
| 0.259849537037037 | 39.762 | 66.088 |
| 0.26002314814814814 | 39.762 | 66.088 |
| 0.2601967592592593 | 39.875 | 66.2 |
| 0.26038194444444446 | 39.875 | 66.2 |
| 0.26055555555555554 | 39.875 | 66.312 |
| 0.2607291666666667 | 39.988 | 66.312 |
| 0.26090277777777776 | 39.988 | 66.088 |
| 0.2610763888888889 | 39.875 | 66.088 |
| 0.26125 | 39.875 | 65.975 |
| 0.2614351851851852 | 39.875 | 65.975 |
| 0.2616087962962963 | 39.875 | 65.862 |
| 0.2617824074074074 | 39.988 | 65.862 |
| 0.2619560185185185 | 39.875 | 65.75 |
| 0.26212962962962966 | 39.875 | 65.75 |
| 0.26230324074074074 | 39.988 | 65.638 |
| 0.2624768518518518 | 39.988 | 65.638 |
| 0.26266203703703705 | 39.875 | 65.525 |
| 0.26283564814814814 | 39.875 | 65.525 |
| 0.2630092592592593 | 39.875 | 65.412 |
| 0.26318287037037036 | 39.875 | 65.412 |
| 0.2633564814814815 | 39.875 | 65.3 |
| 0.2635300925925926 | 39.762 | 65.188 |
| 0.2637037037037037 | 39.762 | 65.3 |
| 0.2638888888888889 | 39.762 | 65.188 |
| 0.26406250000000003 | 39.762 | 65.188 |
| 0.2642361111111111 | 39.762 | 65.075 |
| 0.2644097222222222 | 39.762 | 65.075 |
| 0.26458333333333334 | 39.762 | 65.075 |
| 0.2647569444444445 | 39.875 | 65.075 |
| 0.26494212962962965 | 39.762 | 64.963 |
| 0.26511574074074074 | 39.875 | 64.963 |
| 0.2652893518518518 | 39.762 | 64.963 |
| 0.26546296296296296 | 39.875 | 64.85 |
| 0.2656365740740741 | 39.762 | 64.963 |
| 0.2658101851851852 | 39.762 | 64.85 |
| 0.26598379629629626 | 39.762 | 64.85 |
| 0.2661689814814815 | 39.762 | 64.85 |
| 0.2663425925925926 | 39.762 | 64.85 |
| 0.2665162037037037 | 39.762 | 64.85 |
| 0.26668981481481485 | 39.762 | 64.85 |
| 0.26686342592592593 | 39.762 | 64.738 |
| 0.267037037037037 | 39.762 | 64.738 |
| 0.2672222222222222 | 39.762 | 64.738 |
| 0.26739583333333333 | 39.762 | 64.738 |
| 0.26756944444444447 | 39.762 | 64.738 |
| 0.26774305555555555 | 39.762 | 64.738 |
| 0.26791666666666664 | 39.762 | 64.738 |
| 0.2680902777777778 | 39.762 | 64.625 |
| 0.26827546296296295 | 39.762 | 64.738 |
| 0.2684490740740741 | 39.762 | 64.625 |
| 0.2686226851851852 | 39.762 | 64.625 |
| 0.2687962962962963 | 39.762 | 64.625 |
| 0.2689699074074074 | 39.762 | 64.625 |
| 0.26914351851851853 | 39.875 | 64.625 |
| 0.2693171296296296 | 39.762 | 64.625 |
| 0.26950231481481485 | 39.762 | 64.625 |
| 0.26967592592592593 | 39.762 | 64.512 |
| 0.269849537037037 | 39.762 | 64.625 |
| 0.27002314814814815 | 39.65 | 64.625 |
| 0.2701967592592593 | 39.65 | 64.512 |
| 0.27038194444444447 | 39.65 | 64.512 |
| 0.27055555555555555 | 39.762 | 64.512 |
| 0.27072916666666663 | 39.65 | 64.512 |
| 0.27090277777777777 | 39.762 | 64.512 |
| 0.2710763888888889 | 39.65 | 64.4 |
| 0.27125 | 39.65 | 64.512 |
| 0.2714351851851852 | 39.65 | 64.512 |
| 0.2716087962962963 | 39.65 | 64.512 |
| 0.2717824074074074 | 39.65 | 64.4 |
| 0.2719560185185185 | 39.65 | 64.4 |
| 0.2721296296296296 | 39.65 | 64.4 |
| 0.27230324074074075 | 39.65 | 64.512 |
| 0.27247685185185183 | 39.65 | 64.4 |
| 0.272662037037037 | 39.65 | 64.4 |
| 0.27283564814814815 | 39.65 | 64.4 |
| 0.2730092592592593 | 39.65 | 64.4 |
| 0.27318287037037037 | 39.65 | 64.4 |
| 0.27335648148148145 | 39.65 | 64.4 |
| 0.2735416666666666 | 39.65 | 64.4 |
| 0.27371527777777777 | 39.65 | 64.4 |
| 0.2738888888888889 | 39.65 | 64.4 |
| 0.2740625 | 39.538 | 64.4 |
| 0.2742361111111111 | 39.538 | 64.4 |
| 0.2744212962962963 | 39.65 | 64.4 |
| 0.2745949074074074 | 39.538 | 64.4 |
| 0.2747685185185185 | 39.65 | 64.4 |
| 0.27494212962962966 | 39.538 | 64.287 |
| 0.27511574074074074 | 39.538 | 64.4 |
| 0.2752893518518518 | 39.538 | 64.4 |
| 0.275474537037037 | 39.538 | 64.287 |
| 0.27564814814814814 | 39.538 | 64.4 |
| 0.2758217592592593 | 39.538 | 64.287 |
| 0.27599537037037036 | 39.538 | 64.287 |
| 0.27616898148148145 | 39.538 | 64.287 |
| 0.2763425925925926 | 39.538 | 64.287 |
| 0.27652777777777776 | 39.538 | 64.287 |
| 0.2767013888888889 | 39.538 | 64.287 |
| 0.276875 | 39.538 | 64.287 |
| 0.2770486111111111 | 39.538 | 64.4 |
| 0.2772222222222222 | 39.538 | 64.287 |
| 0.2774074074074074 | 39.538 | 64.287 |
| 0.2775810185185185 | 39.538 | 64.4 |
| 0.27775462962962966 | 39.538 | 64.4 |
| 0.27792824074074074 | 39.65 | 64.512 |
| 0.2781018518518518 | 39.65 | 64.512 |
| 0.27827546296296296 | 39.538 | 64.512 |
| 0.27846064814814814 | 39.65 | 64.625 |
| 0.2786342592592593 | 39.65 | 64.625 |
| 0.27880787037037036 | 39.65 | 64.738 |
| 0.2789814814814815 | 39.762 | 64.738 |
| 0.2791550925925926 | 39.762 | 64.85 |
| 0.2793287037037037 | 39.762 | 64.963 |
| 0.2795138888888889 | 39.875 | 64.963 |
| 0.27968750000000003 | 39.875 | 65.188 |
| 0.2798611111111111 | 39.875 | 65.188 |
| 0.2800347222222222 | 39.988 | 65.3 |
| 0.28020833333333334 | 39.988 | 65.412 |
| 0.2803819444444445 | 39.988 | 65.412 |
| 0.28055555555555556 | 39.988 | 65.525 |
| 0.28074074074074074 | 40.1 | 65.638 |
| 0.2809143518518518 | 40.1 | 65.75 |
| 0.28108796296296296 | 40.1 | 65.862 |
| 0.2812615740740741 | 40.1 | 65.862 |
| 0.2814351851851852 | 40.1 | 65.975 |
| 0.2816087962962963 | 40.1 | 66.088 |
| 0.2817824074074074 | 40.1 | 66.088 |
| 0.2819675925925926 | 40.212 | 66.2 |
| 0.2821412037037037 | 40.212 | 66.312 |
| 0.28231481481481485 | 40.212 | 66.312 |
| 0.28248842592592593 | 40.212 | 66.312 |
| 0.282662037037037 | 40.212 | 66.2 |
| 0.28283564814814816 | 40.212 | 66.2 |
| 0.28302083333333333 | 40.1 | 66.088 |
| 0.28319444444444447 | 40.1 | 66.088 |
| 0.28336805555555555 | 40.212 | 65.862 |
| 0.28354166666666664 | 40.1 | 65.862 |
| 0.2837152777777778 | 40.1 | 65.75 |
| 0.2838888888888889 | 40.212 | 65.75 |
| 0.2840740740740741 | 40.212 | 65.638 |
| 0.2842476851851852 | 40.212 | 65.638 |
| 0.2844212962962963 | 40.1 | 65.525 |
| 0.2845949074074074 | 40.1 | 65.525 |
| 0.28476851851851853 | 40.212 | 65.412 |
| 0.28494212962962967 | 40.1 | 65.412 |
| 0.28512731481481485 | 40.212 | 65.3 |
| 0.28530092592592593 | 40.212 | 65.3 |
| 0.285474537037037 | 40.212 | 65.3 |
| 0.28564814814814815 | 40.1 | 65.188 |
| 0.2858217592592593 | 40.212 | 65.188 |
| 0.28599537037037037 | 40.212 | 65.188 |
| 0.28616898148148145 | 40.1 | 65.075 |
| 0.2863425925925926 | 40.1 | 65.075 |
| 0.28652777777777777 | 40.212 | 65.075 |
| 0.2867013888888889 | 40.212 | 64.963 |
| 0.286875 | 40.1 | 64.963 |
| 0.2870486111111111 | 40.1 | 64.963 |
| 0.2872222222222222 | 40.212 | 64.963 |
| 0.28739583333333335 | 40.212 | 64.85 |
| 0.2875810185185185 | 40.1 | 64.85 |
| 0.2877546296296296 | 40.212 | 64.85 |
| 0.28792824074074075 | 40.1 | 64.85 |
| 0.28810185185185183 | 40.212 | 64.738 |
| 0.28827546296296297 | 40.1 | 64.85 |
| 0.2884490740740741 | 40.1 | 64.738 |
| 0.2886342592592593 | 40.1 | 64.738 |
| 0.28880787037037037 | 40.1 | 64.738 |
| 0.28898148148148145 | 40.1 | 64.625 |
| 0.2891550925925926 | 40.1 | 64.738 |
| 0.2893287037037037 | 40.1 | 64.625 |
| 0.2895023148148148 | 40.1 | 64.738 |
| 0.2896759259259259 | 40.1 | 64.625 |
| 0.2898611111111111 | 40.1 | 64.738 |
| 0.2900347222222222 | 39.988 | 64.625 |
| 0.29020833333333335 | 39.988 | 64.625 |
| 0.29038194444444443 | 39.988 | 64.625 |
| 0.29055555555555557 | 39.988 | 64.625 |
| 0.29072916666666665 | 39.988 | 64.625 |
| 0.2909027777777778 | 39.988 | 64.512 |
| 0.29108796296296297 | 39.988 | 64.512 |
| 0.2912615740740741 | 39.988 | 64.625 |
| 0.2914351851851852 | 39.988 | 64.512 |
| 0.29160879629629627 | 39.988 | 64.512 |
| 0.2917824074074074 | 39.988 | 64.512 |
| 0.29195601851851855 | 39.988 | 64.512 |
| 0.2921412037037037 | 39.988 | 64.512 |
| 0.2923148148148148 | 39.988 | 64.512 |
| 0.29248842592592594 | 39.875 | 64.512 |
| 0.292662037037037 | 39.988 | 64.512 |
| 0.29283564814814816 | 39.988 | 64.512 |
| 0.29300925925925925 | 39.875 | 64.512 |
| 0.2931828703703704 | 39.988 | 64.4 |
| 0.29336805555555556 | 39.988 | 64.512 |
| 0.29354166666666665 | 39.988 | 64.4 |
| 0.2937152777777778 | 39.988 | 64.4 |
| 0.2938888888888889 | 39.988 | 64.4 |
| 0.2940625 | 39.988 | 64.4 |
| 0.2942361111111111 | 39.988 | 64.4 |
| 0.29442129629629626 | 39.988 | 64.4 |
| 0.2945949074074074 | 39.988 | 64.4 |
| 0.29476851851851854 | 39.988 | 64.4 |
| 0.2949421296296296 | 39.988 | 64.4 |
| 0.2951157407407407 | 39.875 | 64.4 |
| 0.29528935185185184 | 39.875 | 64.4 |
| 0.295462962962963 | 39.875 | 64.4 |
| 0.29564814814814816 | 39.875 | 64.287 |
| 0.29582175925925924 | 39.875 | 64.4 |
| 0.2959953703703704 | 39.875 | 64.287 |
| 0.29616898148148146 | 39.875 | 64.4 |
| 0.2963425925925926 | 39.875 | 64.287 |
| 0.29651620370370374 | 39.875 | 64.287 |
| 0.2966898148148148 | 39.875 | 64.287 |
| 0.296875 | 39.875 | 64.287 |
| 0.2970486111111111 | 39.875 | 64.287 |
| 0.2972222222222222 | 39.875 | 64.287 |
| 0.29739583333333336 | 39.762 | 64.287 |
| 0.29756944444444444 | 39.875 | 64.287 |
| 0.2977430555555555 | 39.875 | 64.287 |
| 0.29791666666666666 | 39.762 | 64.287 |
| 0.29810185185185184 | 39.762 | 64.287 |
| 0.298275462962963 | 39.762 | 64.287 |
| 0.29844907407407406 | 39.762 | 64.287 |
| 0.2986226851851852 | 39.762 | 64.287 |
| 0.2987962962962963 | 39.762 | 64.287 |
| 0.2989699074074074 | 39.762 | 64.287 |
| 0.2991435185185185 | 39.762 | 64.287 |
| 0.29931712962962964 | 39.762 | 64.287 |
| 0.2995023148148148 | 39.762 | 64.4 |
| 0.2996759259259259 | 39.762 | 64.4 |
| 0.29984953703703704 | 39.875 | 64.4 |
| 0.3000231481481482 | 39.875 | 64.512 |
| 0.30019675925925926 | 39.875 | 64.512 |
| 0.30037037037037034 | 39.988 | 64.512 |
| 0.3005555555555555 | 39.875 | 64.512 |
| 0.30072916666666666 | 39.988 | 64.625 |
| 0.3009027777777778 | 39.988 | 64.738 |
| 0.3010763888888889 | 39.988 | 64.85 |
| 0.30125 | 40.1 | 64.963 |
| 0.3014236111111111 | 40.1 | 64.963 |
| 0.3016087962962963 | 40.1 | 65.075 |
| 0.3017824074074074 | 40.1 | 65.188 |
| 0.30195601851851855 | 40.1 | 65.3 |
| 0.30212962962962964 | 40.212 | 65.412 |
| 0.3023032407407407 | 40.212 | 65.412 |
| 0.30247685185185186 | 40.212 | 65.525 |
| 0.30266203703703703 | 40.212 | 65.638 |
| 0.3028356481481482 | 40.212 | 65.75 |
| 0.30300925925925926 | 40.325 | 65.862 |
| 0.30318287037037034 | 40.325 | 65.862 |
| 0.3033564814814815 | 40.325 | 65.975 |
| 0.3035300925925926 | 40.325 | 65.975 |
| 0.3037037037037037 | 40.325 | 66.2 |
| 0.3038888888888889 | 40.438 | 66.2 |
| 0.3040625 | 40.438 | 66.312 |
| 0.3042361111111111 | 40.438 | 66.312 |
| 0.30440972222222223 | 40.55 | 66.2 |
| 0.3045833333333333 | 40.438 | 66.088 |
| 0.30476851851851855 | 40.438 | 66.088 |
| 0.30494212962962963 | 40.438 | 65.975 |
| 0.3051157407407407 | 40.438 | 65.862 |
| 0.30528935185185185 | 40.438 | 65.75 |
| 0.305462962962963 | 40.438 | 65.75 |
| 0.3056365740740741 | 40.325 | 65.638 |
| 0.30581018518518516 | 40.438 | 65.638 |
| 0.3059837962962963 | 40.438 | 65.525 |
| 0.3061689814814815 | 40.438 | 65.525 |
| 0.3063425925925926 | 40.438 | 65.412 |
| 0.3065162037037037 | 40.438 | 65.412 |
| 0.30668981481481483 | 40.325 | 65.3 |
| 0.3068634259259259 | 40.325 | 65.3 |
| 0.30703703703703705 | 40.325 | 65.188 |
| 0.30721064814814814 | 40.325 | 65.188 |
| 0.3073842592592593 | 40.325 | 65.188 |
| 0.30756944444444445 | 40.325 | 65.188 |
| 0.30774305555555553 | 40.325 | 65.075 |
| 0.30791666666666667 | 40.438 | 65.075 |
| 0.3080902777777778 | 40.438 | 64.963 |
| 0.3082638888888889 | 40.325 | 64.963 |
| 0.3084375 | 40.325 | 64.963 |
| 0.30862268518518515 | 40.438 | 64.963 |
| 0.3087962962962963 | 40.438 | 64.963 |
| 0.30896990740740743 | 40.438 | 64.963 |
| 0.3091435185185185 | 40.438 | 64.85 |
| 0.3093171296296296 | 40.325 | 64.85 |
| 0.30949074074074073 | 40.438 | 64.85 |
| 0.30966435185185187 | 40.438 | 64.738 |
| 0.30984953703703705 | 40.438 | 64.85 |
| 0.31002314814814813 | 40.438 | 64.738 |
| 0.31019675925925927 | 40.325 | 64.738 |
| 0.31037037037037035 | 40.438 | 64.738 |
| 0.3105439814814815 | 40.438 | 64.738 |
| 0.31071759259259263 | 40.438 | 64.738 |
| 0.3108912037037037 | 40.438 | 64.738 |
| 0.3110648148148148 | 40.438 | 64.738 |
| 0.31124999999999997 | 40.438 | 64.625 |
| 0.3114236111111111 | 40.438 | 64.738 |
| 0.31159722222222225 | 40.438 | 64.625 |
| 0.31177083333333333 | 40.438 | 64.625 |
| 0.3119444444444444 | 40.55 | 64.625 |
| 0.31211805555555555 | 40.55 | 64.625 |
| 0.31230324074074073 | 40.55 | 64.625 |
| 0.31247685185185187 | 40.662 | 64.512 |
| 0.31265046296296295 | 40.55 | 64.512 |
| 0.3128240740740741 | 40.662 | 64.512 |
| 0.31299768518518517 | 40.662 | 64.512 |
| 0.3131712962962963 | 40.55 | 64.512 |
| 0.3133564814814815 | 40.55 | 64.625 |
| 0.3135300925925926 | 40.55 | 64.512 |
| 0.3137037037037037 | 40.55 | 64.512 |
| 0.3138773148148148 | 40.662 | 64.4 |
| 0.31405092592592593 | 40.662 | 64.512 |
| 0.31422453703703707 | 40.55 | 64.512 |
| 0.31440972222222224 | 40.775 | 64.512 |
| 0.3145833333333333 | 40.662 | 64.512 |
| 0.31475694444444446 | 40.662 | 64.512 |
| 0.31493055555555555 | 40.662 | 64.512 |
| 0.3151041666666667 | 40.662 | 64.512 |
| 0.31528935185185186 | 40.662 | 64.4 |
| 0.315462962962963 | 40.662 | 64.4 |
| 0.3156365740740741 | 40.662 | 64.4 |
| 0.31581018518518517 | 40.662 | 64.4 |
| 0.3159837962962963 | 40.662 | 64.4 |
| 0.3161574074074074 | 40.775 | 64.4 |
| 0.3163425925925926 | 40.775 | 64.4 |
| 0.3165162037037037 | 40.775 | 64.4 |
| 0.3166898148148148 | 40.775 | 64.4 |
| 0.3168634259259259 | 40.662 | 64.4 |
| 0.31703703703703706 | 40.775 | 64.4 |
| 0.31721064814814814 | 40.775 | 64.4 |
| 0.3173958333333333 | 40.775 | 64.4 |
| 0.3175694444444444 | 40.775 | 64.4 |
| 0.31774305555555554 | 40.775 | 64.4 |
| 0.3179166666666667 | 40.775 | 64.4 |
| 0.31809027777777776 | 40.775 | 64.4 |
| 0.3182638888888889 | 40.775 | 64.4 |
| 0.3184490740740741 | 40.775 | 64.4 |
| 0.31862268518518516 | 40.775 | 64.4 |
| 0.3187962962962963 | 40.775 | 64.4 |
| 0.31896990740740744 | 40.775 | 64.4 |
| 0.3191435185185185 | 40.775 | 64.4 |
| 0.3193171296296296 | 40.888 | 64.4 |
| 0.31949074074074074 | 40.775 | 64.4 |
| 0.3196759259259259 | 40.888 | 64.287 |
| 0.31984953703703706 | 40.888 | 64.287 |
| 0.32002314814814814 | 40.888 | 64.4 |
| 0.3201967592592592 | 40.888 | 64.4 |
| 0.32037037037037036 | 40.888 | 64.287 |
| 0.3205439814814815 | 40.888 | 64.4 |
| 0.3207175925925926 | 41 | 64.4 |
| 0.32090277777777776 | 41 | 64.4 |
| 0.3210763888888889 | 41.112 | 64.512 |
| 0.32125 | 41.225 | 64.512 |
| 0.3214236111111111 | 41.225 | 64.625 |
| 0.32159722222222226 | 41.225 | 64.625 |
| 0.32177083333333334 | 41.225 | 64.738 |
| 0.3219560185185185 | 41.225 | 64.85 |
| 0.3221296296296296 | 41.225 | 64.85 |
| 0.32230324074074074 | 41.225 | 64.963 |
| 0.3224768518518519 | 41.338 | 65.075 |
| 0.32265046296296296 | 41.338 | 65.188 |
| 0.32282407407407404 | 41.225 | 65.188 |
| 0.3230092592592593 | 41.338 | 65.3 |
| 0.32318287037037036 | 41.338 | 65.412 |
| 0.3233564814814815 | 41.338 | 65.525 |
| 0.3235300925925926 | 41.338 | 65.638 |
| 0.3237037037037037 | 41.338 | 65.75 |
| 0.3238773148148148 | 41.45 | 65.862 |
| 0.3240625 | 41.45 | 65.975 |
| 0.3242361111111111 | 41.562 | 65.975 |
| 0.32440972222222225 | 41.675 | 66.088 |
| 0.32458333333333333 | 41.562 | 66.2 |
| 0.3247569444444444 | 41.562 | 66.312 |
| 0.32493055555555556 | 41.675 | 66.312 |
| 0.3251041666666667 | 41.562 | 66.425 |
| 0.32528935185185187 | 41.675 | 66.425 |
| 0.32546296296296295 | 41.675 | 66.312 |
| 0.3256365740740741 | 41.675 | 66.2 |
| 0.3258101851851852 | 41.675 | 66.088 |
| 0.3259837962962963 | 41.675 | 66.088 |
| 0.3261689814814815 | 41.675 | 65.975 |
| 0.32634259259259263 | 41.675 | 65.975 |
| 0.3265162037037037 | 41.562 | 65.862 |
| 0.3266898148148148 | 41.675 | 65.75 |
| 0.32686342592592593 | 41.675 | 65.75 |
| 0.327037037037037 | 41.675 | 65.638 |
| 0.32722222222222225 | 41.675 | 65.638 |
| 0.32739583333333333 | 41.562 | 65.525 |
| 0.3275694444444444 | 41.675 | 65.525 |
| 0.32774305555555555 | 41.675 | 65.525 |
| 0.3279166666666667 | 41.675 | 65.412 |
| 0.3280902777777778 | 41.788 | 65.412 |
| 0.3282638888888889 | 41.675 | 65.3 |
| 0.3284375 | 41.788 | 65.3 |
| 0.32862268518518517 | 41.675 | 65.3 |
| 0.3287962962962963 | 41.788 | 65.188 |
| 0.32896990740740745 | 41.675 | 65.188 |
| 0.32914351851851853 | 41.675 | 65.188 |
| 0.3293171296296296 | 41.675 | 65.075 |
| 0.3295023148148148 | 41.562 | 65.075 |
| 0.32967592592592593 | 41.562 | 65.075 |
| 0.32984953703703707 | 41.562 | 65.075 |
| 0.33002314814814815 | 41.562 | 65.075 |
| 0.33019675925925923 | 41.562 | 65.075 |
| 0.33037037037037037 | 41.562 | 64.963 |
| 0.33055555555555555 | 41.562 | 64.963 |
| 0.3307291666666667 | 41.562 | 64.963 |
| 0.33090277777777777 | 41.562 | 64.963 |
| 0.33107638888888885 | 41.562 | 64.963 |
| 0.33125 | 41.562 | 64.963 |
| 0.3314236111111111 | 41.675 | 64.85 |
| 0.3316087962962963 | 41.562 | 64.963 |
| 0.3317824074074074 | 41.562 | 64.85 |
| 0.3319560185185185 | 41.562 | 64.85 |
| 0.3321296296296296 | 41.675 | 64.85 |
| 0.33230324074074075 | 41.562 | 64.85 |
| 0.3324768518518519 | 41.675 | 64.738 |
| 0.33266203703703706 | 41.675 | 64.738 |
| 0.33283564814814814 | 41.675 | 64.85 |
| 0.3330092592592592 | 41.788 | 64.738 |
| 0.33318287037037037 | 41.788 | 64.738 |
| 0.3333564814814815 | 41.788 | 64.738 |
| 0.3335300925925926 | 41.788 | 64.738 |
| 0.3337152777777778 | 41.788 | 64.738 |
| 0.3338888888888889 | 41.9 | 64.738 |
| 0.3340625 | 41.788 | 64.738 |
| 0.3342361111111111 | 41.788 | 64.738 |
| 0.3344097222222222 | 41.9 | 64.625 |
| 0.3345833333333333 | 41.9 | 64.738 |
| 0.3347685185185185 | 41.9 | 64.625 |
| 0.3349421296296296 | 41.788 | 64.625 |
| 0.33511574074074074 | 41.788 | 64.625 |
| 0.3352893518518518 | 41.9 | 64.625 |
| 0.335462962962963 | 41.9 | 64.625 |
| 0.3356365740740741 | 42.012 | 64.625 |
| 0.3358217592592592 | 42.012 | 64.625 |
| 0.33599537037037036 | 42.125 | 64.625 |
| 0.3361689814814815 | 42.012 | 64.625 |
| 0.33634259259259264 | 42.012 | 64.625 |
| 0.3365162037037037 | 42.012 | 64.625 |
| 0.33670138888888884 | 42.012 | 64.625 |
| 0.33687500000000004 | 42.012 | 64.625 |
| 0.3370486111111111 | 42.125 | 64.512 |
| 0.33722222222222226 | 42.125 | 64.625 |
| 0.33739583333333334 | 42.012 | 64.625 |
| 0.33758101851851857 | 42.012 | 64.512 |
| 0.33775462962962965 | 42.125 | 64.512 |
| 0.33792824074074074 | 42.125 | 64.625 |
| 0.3381018518518519 | 42.125 | 64.625 |
| 0.33827546296296296 | 42.238 | 64.512 |
| 0.33844907407407404 | 42.125 | 64.512 |
| 0.3386342592592593 | 42.125 | 64.512 |
| 0.33880787037037036 | 42.125 | 64.512 |
| 0.3389814814814815 | 42.125 | 64.625 |
| 0.3391550925925926 | 42.125 | 64.512 |
| 0.33932870370370366 | 42.125 | 64.512 |
| 0.3395023148148148 | 42.125 | 64.512 |
| 0.33967592592592594 | 42.125 | 64.625 |
| 0.3398611111111111 | 42.125 | 64.512 |
| 0.3400347222222222 | 42.125 | 64.512 |
| 0.3402083333333333 | 42.125 | 64.512 |
| 0.3403819444444445 | 42.125 | 64.512 |
| 0.34055555555555556 | 42.125 | 64.512 |
| 0.3407291666666667 | 42.125 | 64.512 |
| 0.3409027777777778 | 42.125 | 64.512 |
| 0.341087962962963 | 42.238 | 64.512 |
| 0.3412615740740741 | 42.125 | 64.512 |
| 0.3414351851851852 | 42.125 | 64.512 |
| 0.3416087962962963 | 42.125 | 64.512 |
| 0.3417824074074074 | 42.238 | 64.512 |
| 0.3419560185185185 | 42.238 | 64.512 |
| 0.3421412037037037 | 42.238 | 64.512 |
| 0.3423148148148148 | 42.238 | 64.512 |
| 0.34248842592592593 | 42.238 | 64.512 |
| 0.342662037037037 | 42.238 | 64.512 |
| 0.3428356481481481 | 42.35 | 64.512 |
| 0.34302083333333333 | 42.35 | 64.512 |
| 0.3431944444444444 | 42.35 | 64.512 |
| 0.34336805555555555 | 42.462 | 64.512 |
| 0.34354166666666663 | 42.462 | 64.512 |
| 0.34371527777777783 | 42.462 | 64.512 |
| 0.3438888888888889 | 42.575 | 64.512 |
| 0.34407407407407403 | 42.688 | 64.512 |
| 0.34424768518518517 | 42.688 | 64.512 |
| 0.3444212962962963 | 42.688 | 64.512 |
| 0.34459490740740745 | 42.688 | 64.512 |
| 0.34476851851851853 | 42.688 | 64.625 |
| 0.3449421296296296 | 42.8 | 64.625 |
| 0.34511574074074075 | 42.8 | 64.738 |
| 0.34530092592592593 | 42.912 | 64.738 |
| 0.34547453703703707 | 42.912 | 64.85 |
| 0.34564814814814815 | 42.912 | 64.963 |
| 0.34582175925925923 | 42.912 | 65.075 |
| 0.34599537037037037 | 42.912 | 65.075 |
| 0.34616898148148145 | 42.912 | 65.188 |
| 0.34634259259259265 | 43.025 | 65.3 |
| 0.34651620370370373 | 43.025 | 65.412 |
| 0.34670138888888885 | 43.138 | 65.525 |
| 0.346875 | 43.138 | 65.638 |
| 0.3470486111111111 | 43.138 | 65.75 |
| 0.34722222222222227 | 43.138 | 65.862 |
| 0.34739583333333335 | 43.138 | 65.862 |
| 0.34758101851851847 | 43.25 | 65.975 |
| 0.34775462962962966 | 43.25 | 66.2 |
| 0.34792824074074075 | 43.25 | 66.2 |
| 0.3481018518518519 | 43.475 | 66.312 |
| 0.34827546296296297 | 43.475 | 66.312 |
| 0.34844907407407405 | 43.475 | 66.425 |
| 0.3486342592592593 | 43.475 | 66.538 |
| 0.34880787037037037 | 43.588 | 66.65 |
| 0.3489814814814815 | 43.588 | 66.65 |
| 0.3491550925925926 | 43.588 | 66.65 |
| 0.34932870370370367 | 43.588 | 66.538 |
| 0.3495138888888889 | 43.475 | 66.538 |
| 0.3496875 | 43.475 | 66.425 |
| 0.3498611111111111 | 43.475 | 66.312 |
| 0.3500347222222222 | 43.475 | 66.312 |
| 0.3502083333333333 | 43.588 | 66.2 |
| 0.3503819444444445 | 43.475 | 66.2 |
| 0.35055555555555556 | 43.475 | 66.088 |
| 0.35074074074074074 | 43.475 | 66.088 |
| 0.3509143518518518 | 43.475 | 65.975 |
| 0.351087962962963 | 43.475 | 65.862 |
| 0.3512615740740741 | 43.588 | 65.862 |
| 0.3514351851851852 | 43.588 | 65.75 |
| 0.3516087962962963 | 43.588 | 65.75 |
| 0.3517939814814815 | 43.7 | 65.75 |
| 0.35196759259259264 | 43.812 | 65.638 |
| 0.3521412037037037 | 43.925 | 65.638 |
| 0.3523148148148148 | 43.925 | 65.638 |
| 0.35248842592592594 | 43.925 | 65.525 |
| 0.352662037037037 | 43.925 | 65.638 |
| 0.3528356481481481 | 43.925 | 65.525 |
| 0.35302083333333334 | 43.925 | 65.525 |
| 0.3531944444444444 | 44.038 | 65.525 |
| 0.35336805555555556 | 43.925 | 65.525 |
| 0.35354166666666664 | 44.038 | 65.412 |
| 0.3537152777777777 | 44.038 | 65.412 |
| 0.3538888888888889 | 44.038 | 65.412 |
| 0.35407407407407404 | 44.038 | 65.412 |
| 0.3542476851851852 | 44.038 | 65.412 |
| 0.35442129629629626 | 44.038 | 65.412 |
| 0.35459490740740746 | 44.038 | 65.412 |
| 0.35476851851851854 | 44.038 | 65.412 |
| 0.35495370370370366 | 44.038 | 65.3 |
| 0.3551273148148148 | 44.15 | 65.3 |
| 0.35530092592592594 | 44.15 | 65.3 |
| 0.3554745370370371 | 44.262 | 65.3 |
| 0.35564814814814816 | 44.262 | 65.3 |
| 0.35582175925925924 | 44.262 | 65.3 |
| 0.3560069444444445 | 44.262 | 65.3 |
| 0.35618055555555556 | 44.262 | 65.3 |
| 0.3563541666666667 | 44.262 | 65.3 |
| 0.3565277777777778 | 44.262 | 65.188 |
| 0.35670138888888886 | 44.262 | 65.3 |
| 0.356875 | 44.375 | 65.188 |
| 0.3570486111111111 | 44.375 | 65.3 |
| 0.3572337962962963 | 44.375 | 65.188 |
| 0.3574074074074074 | 44.488 | 65.188 |
| 0.3575810185185185 | 44.488 | 65.188 |
| 0.3577546296296296 | 44.488 | 65.188 |
| 0.35792824074074076 | 44.488 | 65.188 |
| 0.3581018518518519 | 44.6 | 65.075 |
| 0.358275462962963 | 44.6 | 65.075 |
| 0.3584606481481481 | 44.6 | 65.188 |
| 0.3586342592592593 | 44.712 | 65.075 |
| 0.3588078703703704 | 44.712 | 65.075 |
| 0.3589814814814815 | 44.712 | 65.075 |
| 0.3591550925925926 | 44.712 | 65.075 |
| 0.3593287037037037 | 44.712 | 65.075 |
| 0.3595023148148148 | 44.825 | 65.075 |
| 0.3596875 | 44.825 | 65.075 |
| 0.35986111111111113 | 45.05 | 65.075 |
| 0.3600347222222222 | 45.05 | 65.075 |
| 0.3602083333333333 | 45.05 | 65.075 |
| 0.36038194444444444 | 45.05 | 65.075 |
| 0.3605555555555556 | 45.162 | 64.963 |
| 0.36074074074074075 | 45.162 | 65.075 |
| 0.36091435185185183 | 45.275 | 65.075 |
| 0.3610879629629629 | 45.275 | 65.075 |
| 0.3612615740740741 | 45.275 | 64.963 |
| 0.3614351851851852 | 45.275 | 64.963 |
| 0.36160879629629633 | 45.162 | 64.963 |
| 0.3617824074074074 | 45.162 | 64.963 |
| 0.36196759259259265 | 45.275 | 64.963 |
| 0.36214120370370373 | 45.275 | 64.963 |
| 0.3623148148148148 | 45.275 | 64.963 |
| 0.36248842592592595 | 45.275 | 64.963 |
| 0.36266203703703703 | 45.388 | 64.963 |
| 0.3628356481481481 | 45.388 | 64.963 |
| 0.36302083333333335 | 45.388 | 64.963 |
| 0.36319444444444443 | 45.388 | 64.963 |
| 0.36336805555555557 | 45.388 | 64.85 |
| 0.36354166666666665 | 45.5 | 64.963 |
| 0.36371527777777773 | 45.5 | 64.963 |
| 0.3638888888888889 | 45.612 | 64.963 |
| 0.36407407407407405 | 45.612 | 64.85 |
| 0.3642476851851852 | 45.612 | 64.85 |
| 0.36442129629629627 | 45.612 | 64.963 |
| 0.36459490740740735 | 45.612 | 64.963 |
| 0.36476851851851855 | 45.612 | 64.85 |
| 0.36494212962962963 | 45.612 | 64.85 |
| 0.36511574074074077 | 45.725 | 64.85 |
| 0.3653009259259259 | 45.725 | 64.85 |
| 0.3654745370370371 | 45.725 | 64.85 |
| 0.36564814814814817 | 45.838 | 64.85 |
| 0.36582175925925925 | 45.838 | 64.85 |
| 0.3659953703703704 | 45.95 | 64.85 |
| 0.36616898148148147 | 45.95 | 64.963 |
| 0.3663541666666667 | 46.062 | 64.85 |
| 0.3665277777777778 | 45.95 | 64.963 |
| 0.36670138888888887 | 45.95 | 64.85 |
| 0.366875 | 45.95 | 64.85 |
| 0.3670486111111111 | 45.95 | 64.85 |
| 0.36722222222222217 | 46.062 | 64.85 |
| 0.3674074074074074 | 46.062 | 64.85 |
| 0.3675810185185185 | 46.062 | 64.85 |
| 0.3677546296296296 | 46.062 | 64.963 |
| 0.3679282407407407 | 46.062 | 64.963 |
| 0.3681018518518519 | 46.062 | 64.963 |
| 0.368275462962963 | 46.175 | 64.963 |
| 0.3684606481481481 | 46.062 | 65.188 |
| 0.36863425925925924 | 46.175 | 65.188 |
| 0.3688078703703704 | 46.288 | 65.3 |
| 0.3689814814814815 | 46.288 | 65.412 |
| 0.3691550925925926 | 46.4 | 65.525 |
| 0.3693402777777777 | 46.512 | 65.638 |
| 0.3695138888888889 | 46.512 | 65.75 |
| 0.3696875 | 46.625 | 65.862 |
| 0.36986111111111114 | 46.625 | 65.975 |
| 0.3700347222222222 | 46.738 | 66.088 |
| 0.3702083333333333 | 46.85 | 66.2 |
| 0.37038194444444444 | 46.962 | 66.312 |
| 0.3705671296296296 | 46.962 | 66.312 |
| 0.37074074074074076 | 47.075 | 66.425 |
| 0.37091435185185184 | 47.075 | 66.538 |
| 0.3710879629629629 | 47.188 | 66.65 |
| 0.37126157407407406 | 47.3 | 66.65 |
| 0.3714351851851852 | 47.3 | 66.762 |
| 0.37160879629629634 | 47.3 | 66.65 |
| 0.37179398148148146 | 47.3 | 66.762 |
| 0.37196759259259254 | 47.412 | 66.65 |
| 0.37214120370370374 | 47.412 | 66.538 |
| 0.3723148148148148 | 47.412 | 66.538 |
| 0.37248842592592596 | 47.412 | 66.425 |
| 0.37266203703703704 | 47.412 | 66.425 |
| 0.3728472222222223 | 47.525 | 66.312 |
| 0.37302083333333336 | 47.75 | 66.312 |
| 0.37319444444444444 | 47.638 | 66.312 |
| 0.3733680555555556 | 47.638 | 66.312 |
| 0.37354166666666666 | 47.638 | 66.2 |
| 0.37371527777777774 | 47.75 | 66.2 |
| 0.373900462962963 | 47.75 | 66.2 |
| 0.37407407407407406 | 47.75 | 66.088 |
| 0.3742476851851852 | 47.75 | 66.088 |
| 0.3744212962962963 | 47.638 | 66.088 |
| 0.37459490740740736 | 47.75 | 66.088 |
| 0.3747685185185185 | 47.75 | 65.975 |
| 0.3749537037037037 | 47.862 | 65.975 |
| 0.3751273148148148 | 47.975 | 65.975 |
| 0.3753009259259259 | 47.975 | 65.975 |
| 0.375474537037037 | 47.862 | 65.975 |
| 0.3756481481481482 | 47.862 | 65.975 |
| 0.37582175925925926 | 47.862 | 65.862 |
| 0.3759953703703704 | 47.862 | 65.862 |
| 0.3761689814814815 | 47.975 | 65.975 |
| 0.3763541666666667 | 47.862 | 65.862 |
| 0.3765277777777778 | 47.975 | 65.862 |
| 0.3767013888888889 | 47.862 | 65.975 |
| 0.376875 | 47.862 | 65.975 |
| 0.3770486111111111 | 47.862 | 65.862 |
| 0.3772222222222222 | 47.862 | 65.862 |
| 0.3773958333333333 | 47.862 | 65.862 |
| 0.3775810185185185 | 47.975 | 65.975 |
| 0.37775462962962963 | 47.975 | 65.975 |
| 0.3779282407407407 | 47.975 | 65.975 |
| 0.3781018518518518 | 47.975 | 65.975 |
| 0.378275462962963 | 47.975 | 65.975 |
| 0.3784490740740741 | 47.975 | 65.975 |
| 0.37863425925925925 | 48.088 | 65.975 |
| 0.37880787037037034 | 48.2 | 65.862 |
| 0.37898148148148153 | 48.425 | 65.862 |
| 0.3791550925925926 | 48.312 | 65.862 |
| 0.3793287037037037 | 48.312 | 65.862 |
| 0.3795138888888889 | 48.312 | 65.862 |
| 0.3796875 | 48.312 | 65.862 |
| 0.37986111111111115 | 48.312 | 65.862 |
| 0.38003472222222223 | 48.425 | 65.862 |
| 0.3802083333333333 | 48.425 | 65.862 |
| 0.38038194444444445 | 48.425 | 65.862 |
| 0.38055555555555554 | 48.425 | 65.75 |
| 0.38074074074074077 | 48.425 | 65.862 |
| 0.38091435185185185 | 48.425 | 65.862 |
| 0.38108796296296293 | 48.425 | 65.862 |
| 0.38126157407407407 | 48.538 | 65.75 |
| 0.38144675925925925 | 48.538 | 65.862 |
| 0.3816203703703704 | 48.65 | 65.75 |
| 0.38179398148148147 | 48.762 | 65.75 |
| 0.38196759259259255 | 48.762 | 65.75 |
| 0.3821412037037037 | 48.875 | 65.75 |
| 0.38231481481481483 | 48.988 | 65.862 |
| 0.38248842592592597 | 48.988 | 65.862 |
| 0.3826736111111111 | 49.1 | 65.862 |
| 0.38284722222222217 | 49.1 | 65.862 |
| 0.38302083333333337 | 49.325 | 65.862 |
| 0.38319444444444445 | 49.55 | 65.862 |
| 0.3833680555555556 | 49.662 | 65.862 |
| 0.38354166666666667 | 49.55 | 65.862 |
| 0.38371527777777775 | 49.55 | 65.862 |
| 0.383900462962963 | 49.438 | 65.862 |
| 0.38407407407407407 | 49.438 | 65.862 |
| 0.3842476851851852 | 49.438 | 65.862 |
| 0.3844212962962963 | 49.55 | 65.75 |
| 0.38459490740740737 | 49.438 | 65.75 |
| 0.3847685185185185 | 49.438 | 65.75 |
| 0.3849537037037037 | 49.55 | 65.862 |
| 0.3851273148148148 | 49.662 | 65.75 |
| 0.3853009259259259 | 49.775 | 65.862 |
| 0.385474537037037 | 49.888 | 65.862 |
| 0.3856481481481482 | 49.775 | 65.75 |
| 0.38582175925925927 | 49.775 | 65.75 |
| 0.38600694444444444 | 49.888 | 65.75 |
| 0.3861805555555555 | 50 | 65.75 |
| 0.3863541666666667 | 50.112 | 65.75 |
| 0.3865277777777778 | 49.888 | 65.75 |
| 0.3867013888888889 | 50 | 65.862 |
| 0.38688657407407406 | 50 | 65.75 |
| 0.3870601851851852 | 50.225 | 65.75 |
| 0.38723379629629634 | 50.338 | 65.75 |
| 0.3874074074074074 | 50.225 | 65.75 |
| 0.3875810185185185 | 50.225 | 65.75 |
| 0.38775462962962964 | 50.225 | 65.75 |
| 0.3879398148148148 | 50.225 | 65.75 |
| 0.38811342592592596 | 50.338 | 65.75 |
| 0.38828703703703704 | 50.225 | 65.75 |
| 0.3884606481481481 | 50.225 | 65.75 |
| 0.38863425925925926 | 50.225 | 65.75 |
| 0.38880787037037035 | 50.338 | 65.75 |
| 0.3889930555555556 | 50.45 | 65.75 |
| 0.38916666666666666 | 50.45 | 65.75 |
| 0.38934027777777774 | 50.45 | 65.75 |
| 0.3895138888888889 | 50.45 | 65.75 |
| 0.38968749999999996 | 50.562 | 65.75 |
| 0.38986111111111116 | 50.562 | 65.75 |
| 0.3900462962962963 | 50.675 | 65.75 |
| 0.39021990740740736 | 50.675 | 65.75 |
| 0.3903935185185185 | 50.675 | 65.75 |
| 0.39056712962962964 | 50.788 | 65.75 |
| 0.3907407407407408 | 50.788 | 65.862 |
| 0.39091435185185186 | 50.788 | 65.975 |
| 0.39108796296296294 | 50.788 | 65.975 |
| 0.3912731481481482 | 50.9 | 66.2 |
| 0.39144675925925926 | 51.012 | 66.2 |
| 0.3916203703703704 | 51.125 | 66.312 |
| 0.3917939814814815 | 51.238 | 66.538 |
| 0.39196759259259256 | 51.35 | 66.538 |
| 0.3921412037037037 | 51.462 | 66.65 |
| 0.3923263888888889 | 51.688 | 66.762 |
| 0.3925 | 51.8 | 66.875 |
| 0.3926736111111111 | 51.688 | 66.988 |
| 0.3928472222222222 | 51.688 | 67.212 |
| 0.3930208333333333 | 51.688 | 67.212 |
| 0.39319444444444446 | 51.912 | 67.438 |
| 0.39337962962962963 | 52.138 | 67.438 |
| 0.3935532407407407 | 52.25 | 67.55 |
| 0.3937268518518518 | 52.362 | 67.55 |
| 0.393900462962963 | 52.362 | 67.662 |
| 0.3940740740740741 | 52.362 | 67.662 |
| 0.3942476851851852 | 52.362 | 67.662 |
| 0.39443287037037034 | 52.362 | 67.662 |
| 0.39460648148148153 | 52.25 | 67.775 |
| 0.3947800925925926 | 52.25 | 67.775 |
| 0.3949537037037037 | 52.25 | 67.662 |
| 0.39512731481481483 | 52.362 | 67.662 |
| 0.3953125 | 52.25 | 67.662 |
| 0.39548611111111115 | 52.138 | 67.662 |
| 0.39565972222222223 | 52.138 | 67.662 |
| 0.3958333333333333 | 52.138 | 67.775 |
| 0.39600694444444445 | 52.138 | 67.662 |
| 0.39618055555555554 | 52.138 | 67.55 |
| 0.3963541666666666 | 52.25 | 67.55 |
| 0.39653935185185185 | 52.362 | 67.438 |
| 0.39671296296296293 | 52.475 | 67.55 |
| 0.39688657407407407 | 52.7 | 67.438 |
| 0.39706018518518515 | 52.925 | 67.438 |
| 0.39723379629629635 | 53.038 | 67.438 |
| 0.39740740740740743 | 53.038 | 67.325 |
| 0.3975810185185185 | 52.925 | 67.325 |
| 0.3977662037037037 | 52.925 | 67.212 |
| 0.39793981481481483 | 52.925 | 67.212 |
| 0.39811342592592597 | 52.925 | 67.1 |
| 0.39828703703703705 | 52.812 | 66.988 |
| 0.39846064814814813 | 52.925 | 66.988 |
| 0.39863425925925927 | 52.925 | 66.988 |
| 0.39880787037037035 | 53.15 | 66.875 |
| 0.3989930555555556 | 53.262 | 66.762 |
| 0.39916666666666667 | 53.488 | 66.875 |
| 0.39934027777777775 | 53.6 | 66.762 |
| 0.3995138888888889 | 53.6 | 66.762 |
| 0.3996875 | 53.712 | 66.65 |
| 0.39986111111111106 | 53.712 | 66.65 |
| 0.4000462962962963 | 53.6 | 66.65 |
| 0.40021990740740737 | 53.6 | 66.538 |
| 0.4003935185185185 | 53.488 | 66.538 |
| 0.40056712962962965 | 53.6 | 66.538 |
| 0.4007407407407408 | 53.488 | 66.538 |
| 0.40091435185185187 | 53.488 | 66.538 |
| 0.40108796296296295 | 53.6 | 66.538 |
| 0.4012731481481482 | 53.6 | 66.538 |
| 0.40144675925925927 | 53.712 | 66.538 |
| 0.4016203703703704 | 53.825 | 66.538 |
| 0.4017939814814815 | 53.825 | 66.538 |
| 0.40196759259259257 | 53.938 | 66.425 |
| 0.4021412037037037 | 54.05 | 66.425 |
| 0.4023148148148148 | 54.162 | 66.425 |
| 0.4025 | 54.162 | 66.425 |
| 0.4026736111111111 | 54.162 | 66.538 |
| 0.4028472222222222 | 54.275 | 66.538 |
| 0.40302083333333333 | 54.388 | 66.538 |
| 0.4031944444444444 | 54.388 | 66.538 |
| 0.4033680555555556 | 54.388 | 66.538 |
| 0.4035416666666667 | 54.388 | 66.425 |
| 0.4037268518518518 | 54.5 | 66.425 |
| 0.40390046296296295 | 54.612 | 66.425 |
| 0.4040740740740741 | 54.612 | 66.425 |
| 0.4042476851851852 | 54.5 | 66.425 |
| 0.4044212962962963 | 54.5 | 66.425 |
| 0.4045949074074074 | 54.612 | 66.425 |
| 0.4047685185185185 | 54.838 | 66.312 |
| 0.4049537037037037 | 54.838 | 66.425 |
| 0.40512731481481484 | 54.95 | 66.312 |
| 0.4053009259259259 | 55.175 | 66.312 |
| 0.405474537037037 | 55.288 | 66.425 |
| 0.40564814814814815 | 55.175 | 66.425 |
| 0.4058333333333333 | 55.288 | 66.425 |
| 0.40600694444444446 | 55.175 | 66.312 |
| 0.40618055555555554 | 55.288 | 66.312 |
| 0.4063541666666666 | 55.288 | 66.312 |
| 0.40652777777777777 | 55.288 | 66.425 |
| 0.4067013888888889 | 55.4 | 66.312 |
| 0.4068865740740741 | 55.512 | 66.312 |
| 0.40706018518518516 | 55.625 | 66.312 |
| 0.40723379629629625 | 55.625 | 66.312 |
| 0.40740740740740744 | 55.85 | 66.312 |
| 0.4075810185185185 | 55.962 | 66.312 |
| 0.40775462962962966 | 55.85 | 66.312 |
| 0.4079398148148148 | 55.738 | 66.312 |
| 0.408113425925926 | 55.85 | 66.312 |
| 0.40828703703703706 | 55.85 | 66.312 |
| 0.40846064814814814 | 55.85 | 66.312 |
| 0.4086342592592593 | 55.962 | 66.312 |
| 0.40880787037037036 | 55.962 | 66.312 |
| 0.4089930555555556 | 56.188 | 66.312 |
| 0.4091666666666667 | 56.188 | 66.312 |
| 0.40934027777777776 | 56.075 | 66.2 |
| 0.4095138888888889 | 56.075 | 66.312 |
| 0.4096875 | 56.075 | 66.312 |
| 0.40986111111111106 | 56.188 | 66.312 |
| 0.41003472222222226 | 56.3 | 66.312 |
| 0.41020833333333334 | 56.525 | 66.2 |
| 0.4103935185185185 | 56.412 | 66.312 |
| 0.4105671296296296 | 56.525 | 66.312 |
| 0.4107407407407408 | 56.525 | 66.2 |
| 0.4109143518518519 | 56.638 | 66.312 |
| 0.41108796296296296 | 56.525 | 66.2 |
| 0.4112615740740741 | 56.412 | 66.2 |
| 0.4114351851851852 | 56.525 | 66.2 |
| 0.4116203703703704 | 56.412 | 66.2 |
| 0.4117939814814815 | 56.412 | 66.2 |
| 0.4119675925925926 | 56.412 | 66.2 |
| 0.4121412037037037 | 56.525 | 66.2 |
| 0.4123148148148148 | 56.638 | 66.2 |
| 0.4124884259259259 | 56.638 | 66.312 |
| 0.4126736111111111 | 56.638 | 66.2 |
| 0.4128472222222222 | 56.638 | 66.312 |
| 0.41302083333333334 | 56.75 | 66.2 |
| 0.4131944444444444 | 56.75 | 66.2 |
| 0.4133680555555555 | 56.862 | 66.2 |
| 0.4135416666666667 | 56.975 | 66.2 |
| 0.4137268518518518 | 56.975 | 66.2 |
| 0.41390046296296296 | 56.975 | 66.2 |
| 0.41407407407407404 | 57.088 | 66.2 |
| 0.41424768518518523 | 57.088 | 66.2 |
| 0.4144212962962963 | 57.312 | 66.2 |
| 0.4145949074074074 | 57.312 | 66.2 |
| 0.4147800925925926 | 57.425 | 66.2 |
| 0.4149537037037037 | 57.425 | 66.2 |
| 0.41512731481481485 | 57.65 | 66.2 |
| 0.41530092592592593 | 57.65 | 66.2 |
| 0.415474537037037 | 57.65 | 66.2 |
| 0.41564814814814816 | 57.762 | 66.312 |
| 0.41582175925925924 | 57.65 | 66.2 |
| 0.41600694444444447 | 57.762 | 66.2 |
| 0.41618055555555555 | 57.875 | 66.312 |
| 0.41635416666666664 | 57.875 | 66.2 |
| 0.4165277777777778 | 57.988 | 66.312 |
| 0.41670138888888886 | 58.212 | 66.312 |
| 0.4168865740740741 | 58.212 | 66.312 |
| 0.4170601851851852 | 58.325 | 66.2 |
| 0.41723379629629626 | 58.438 | 66.312 |
| 0.4174074074074074 | 58.55 | 66.312 |
| 0.41758101851851853 | 58.438 | 66.2 |
| 0.41775462962962967 | 58.55 | 66.2 |
| 0.41792824074074075 | 58.55 | 66.2 |
| 0.4181134259259259 | 58.55 | 66.312 |
| 0.41828703703703707 | 58.55 | 66.2 |
| 0.41846064814814815 | 58.662 | 66.2 |
| 0.4186342592592593 | 58.775 | 66.2 |
| 0.41880787037037037 | 58.888 | 66.2 |
| 0.4189930555555556 | 58.888 | 66.2 |
| 0.4191666666666667 | 58.775 | 66.2 |
| 0.41934027777777777 | 58.775 | 66.312 |
| 0.4195138888888889 | 58.662 | 66.312 |
| 0.4196875 | 58.775 | 66.312 |
| 0.4198611111111111 | 58.888 | 66.312 |
| 0.4200347222222222 | 58.888 | 66.312 |
| 0.4202199074074074 | 58.888 | 66.312 |
| 0.4203935185185185 | 58.775 | 66.312 |
| 0.4205671296296296 | 58.775 | 66.312 |
| 0.4207407407407407 | 58.888 | 66.2 |
| 0.4209143518518519 | 58.775 | 66.2 |
| 0.42108796296296297 | 58.888 | 66.312 |
| 0.42127314814814815 | 58.888 | 66.312 |
| 0.42144675925925923 | 58.775 | 66.2 |
| 0.4216203703703704 | 58.888 | 66.2 |
| 0.4217939814814815 | 58.775 | 66.312 |
| 0.4219675925925926 | 58.775 | 66.2 |
| 0.4221412037037037 | 58.888 | 66.2 |
| 0.4223263888888889 | 58.775 | 66.2 |
| 0.42250000000000004 | 58.662 | 66.2 |
| 0.4226736111111111 | 58.775 | 66.2 |
| 0.4228472222222222 | 58.662 | 66.2 |
| 0.42302083333333335 | 58.662 | 66.2 |
| 0.42319444444444443 | 58.888 | 66.2 |
| 0.4233680555555555 | 58.888 | 66.2 |
| 0.42355324074074074 | 58.888 | 66.312 |
| 0.4237268518518518 | 59 | 66.2 |
| 0.42390046296296297 | 59 | 66.2 |
| 0.42407407407407405 | 59 | 66.2 |
| 0.42424768518518513 | 59.112 | 66.312 |
| 0.4244212962962963 | 59.112 | 66.2 |
| 0.4245949074074074 | 59.225 | 66.2 |
| 0.4247800925925926 | 59.225 | 66.2 |
| 0.42495370370370367 | 59.338 | 66.312 |
| 0.42512731481481486 | 59.45 | 66.2 |
| 0.42530092592592594 | 59.562 | 66.2 |
| 0.425474537037037 | 59.675 | 66.2 |
| 0.4256597222222222 | 59.788 | 66.2 |
| 0.42583333333333334 | 59.9 | 66.2 |
| 0.4260069444444445 | 60.012 | 66.2 |
| 0.42618055555555556 | 60.238 | 66.2 |
| 0.42635416666666665 | 60.35 | 66.2 |
| 0.4265277777777778 | 60.35 | 66.312 |
| 0.42670138888888887 | 60.462 | 66.312 |
| 0.4268865740740741 | 60.462 | 66.2 |
| 0.4270601851851852 | 60.462 | 66.312 |
| 0.42723379629629626 | 60.688 | 66.312 |
| 0.4274074074074074 | 60.8 | 66.312 |
| 0.4275810185185185 | 60.8 | 66.2 |
| 0.4277546296296297 | 61.025 | 66.2 |
| 0.4279398148148148 | 61.138 | 66.312 |
| 0.4281134259259259 | 61.25 | 66.312 |
| 0.428287037037037 | 61.25 | 66.2 |
| 0.42846064814814816 | 61.362 | 66.2 |
| 0.4286342592592593 | 61.25 | 66.2 |
| 0.4288078703703704 | 61.25 | 66.312 |
| 0.42898148148148146 | 61.362 | 66.312 |
| 0.4291666666666667 | 61.588 | 66.2 |
| 0.4293402777777778 | 61.588 | 66.2 |
| 0.4295138888888889 | 61.588 | 66.2 |
| 0.4296875 | 61.475 | 66.2 |
| 0.4298611111111111 | 61.475 | 66.2 |
| 0.4300462962962963 | 61.588 | 66.312 |
| 0.4302199074074074 | 61.475 | 66.425 |
| 0.43039351851851854 | 61.588 | 66.538 |
| 0.4305671296296296 | 61.7 | 66.65 |
| 0.4307407407407407 | 61.812 | 66.762 |
| 0.43092592592592593 | 61.925 | 66.988 |
| 0.431099537037037 | 62.15 | 67.1 |
| 0.43127314814814816 | 62.15 | 67.212 |
| 0.43144675925925924 | 62.262 | 67.325 |
| 0.4316203703703703 | 62.375 | 67.438 |
| 0.4317939814814815 | 62.488 | 67.662 |
| 0.4319675925925926 | 62.6 | 67.775 |